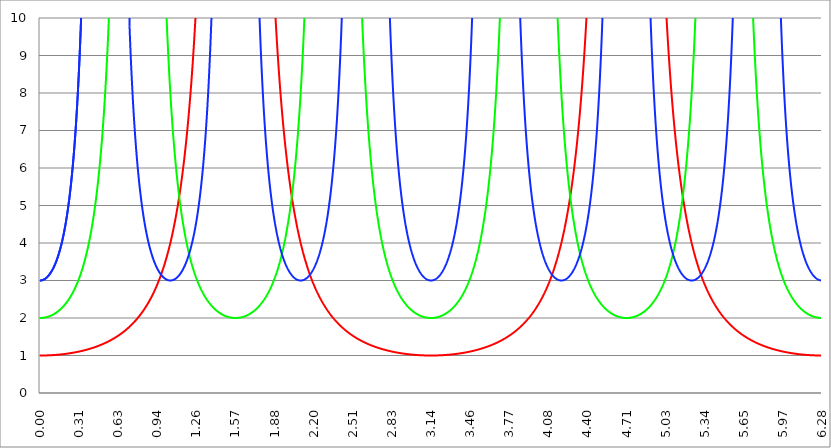
| Category | Series 1 | Series 0 | Series 2 |
|---|---|---|---|
| 0.0 | 1 | 2 | 3 |
| 0.00314159265358979 | 1 | 2 | 3 |
| 0.00628318530717958 | 1 | 2 | 3.001 |
| 0.00942477796076938 | 1 | 2.001 | 3.002 |
| 0.0125663706143592 | 1 | 2.001 | 3.004 |
| 0.015707963267949 | 1 | 2.002 | 3.007 |
| 0.0188495559215388 | 1 | 2.003 | 3.01 |
| 0.0219911485751285 | 1 | 2.004 | 3.013 |
| 0.0251327412287183 | 1.001 | 2.005 | 3.017 |
| 0.0282743338823081 | 1.001 | 2.006 | 3.022 |
| 0.0314159265358979 | 1.001 | 2.008 | 3.027 |
| 0.0345575191894877 | 1.001 | 2.01 | 3.032 |
| 0.0376991118430775 | 1.001 | 2.011 | 3.039 |
| 0.0408407044966673 | 1.002 | 2.013 | 3.045 |
| 0.0439822971502571 | 1.002 | 2.016 | 3.053 |
| 0.0471238898038469 | 1.002 | 2.018 | 3.061 |
| 0.0502654824574367 | 1.003 | 2.02 | 3.069 |
| 0.0534070751110265 | 1.003 | 2.023 | 3.078 |
| 0.0565486677646163 | 1.003 | 2.026 | 3.088 |
| 0.059690260418206 | 1.004 | 2.029 | 3.098 |
| 0.0628318530717958 | 1.004 | 2.032 | 3.109 |
| 0.0659734457253856 | 1.004 | 2.035 | 3.121 |
| 0.0691150383789754 | 1.005 | 2.039 | 3.133 |
| 0.0722566310325652 | 1.005 | 2.042 | 3.146 |
| 0.075398223686155 | 1.006 | 2.046 | 3.159 |
| 0.0785398163397448 | 1.006 | 2.05 | 3.173 |
| 0.0816814089933346 | 1.007 | 2.054 | 3.188 |
| 0.0848230016469244 | 1.007 | 2.059 | 3.203 |
| 0.0879645943005142 | 1.008 | 2.063 | 3.219 |
| 0.091106186954104 | 1.008 | 2.068 | 3.236 |
| 0.0942477796076937 | 1.009 | 2.073 | 3.253 |
| 0.0973893722612835 | 1.01 | 2.078 | 3.271 |
| 0.100530964914873 | 1.01 | 2.083 | 3.29 |
| 0.103672557568463 | 1.011 | 2.089 | 3.31 |
| 0.106814150222053 | 1.011 | 2.094 | 3.33 |
| 0.109955742875643 | 1.012 | 2.1 | 3.352 |
| 0.113097335529233 | 1.013 | 2.106 | 3.374 |
| 0.116238928182822 | 1.014 | 2.112 | 3.397 |
| 0.119380520836412 | 1.014 | 2.118 | 3.42 |
| 0.122522113490002 | 1.015 | 2.125 | 3.445 |
| 0.125663706143592 | 1.016 | 2.132 | 3.47 |
| 0.128805298797181 | 1.017 | 2.139 | 3.497 |
| 0.131946891450771 | 1.018 | 2.146 | 3.524 |
| 0.135088484104361 | 1.018 | 2.153 | 3.552 |
| 0.138230076757951 | 1.019 | 2.161 | 3.581 |
| 0.141371669411541 | 1.02 | 2.169 | 3.612 |
| 0.14451326206513 | 1.021 | 2.177 | 3.643 |
| 0.14765485471872 | 1.022 | 2.185 | 3.675 |
| 0.15079644737231 | 1.023 | 2.194 | 3.709 |
| 0.1539380400259 | 1.024 | 2.202 | 3.743 |
| 0.15707963267949 | 1.025 | 2.211 | 3.779 |
| 0.160221225333079 | 1.026 | 2.22 | 3.816 |
| 0.163362817986669 | 1.027 | 2.23 | 3.854 |
| 0.166504410640259 | 1.028 | 2.239 | 3.893 |
| 0.169646003293849 | 1.029 | 2.249 | 3.934 |
| 0.172787595947439 | 1.03 | 2.259 | 3.976 |
| 0.175929188601028 | 1.032 | 2.27 | 4.019 |
| 0.179070781254618 | 1.033 | 2.28 | 4.064 |
| 0.182212373908208 | 1.034 | 2.291 | 4.111 |
| 0.185353966561798 | 1.035 | 2.302 | 4.159 |
| 0.188495559215388 | 1.036 | 2.314 | 4.208 |
| 0.191637151868977 | 1.038 | 2.325 | 4.259 |
| 0.194778744522567 | 1.039 | 2.337 | 4.312 |
| 0.197920337176157 | 1.04 | 2.349 | 4.367 |
| 0.201061929829747 | 1.042 | 2.362 | 4.423 |
| 0.204203522483336 | 1.043 | 2.375 | 4.482 |
| 0.207345115136926 | 1.044 | 2.388 | 4.542 |
| 0.210486707790516 | 1.046 | 2.401 | 4.605 |
| 0.213628300444106 | 1.047 | 2.415 | 4.669 |
| 0.216769893097696 | 1.049 | 2.429 | 4.736 |
| 0.219911485751285 | 1.05 | 2.443 | 4.805 |
| 0.223053078404875 | 1.051 | 2.457 | 4.877 |
| 0.226194671058465 | 1.053 | 2.472 | 4.95 |
| 0.229336263712055 | 1.054 | 2.488 | 5.027 |
| 0.232477856365645 | 1.056 | 2.503 | 5.106 |
| 0.235619449019234 | 1.058 | 2.519 | 5.188 |
| 0.238761041672824 | 1.059 | 2.536 | 5.273 |
| 0.241902634326414 | 1.061 | 2.552 | 5.361 |
| 0.245044226980004 | 1.063 | 2.569 | 5.453 |
| 0.248185819633594 | 1.064 | 2.587 | 5.547 |
| 0.251327412287183 | 1.066 | 2.604 | 5.646 |
| 0.254469004940773 | 1.068 | 2.623 | 5.747 |
| 0.257610597594363 | 1.069 | 2.641 | 5.853 |
| 0.260752190247953 | 1.071 | 2.66 | 5.963 |
| 0.263893782901543 | 1.073 | 2.68 | 6.076 |
| 0.267035375555132 | 1.075 | 2.7 | 6.195 |
| 0.270176968208722 | 1.077 | 2.72 | 6.317 |
| 0.273318560862312 | 1.079 | 2.741 | 6.445 |
| 0.276460153515902 | 1.081 | 2.762 | 6.578 |
| 0.279601746169492 | 1.082 | 2.783 | 6.716 |
| 0.282743338823082 | 1.084 | 2.805 | 6.86 |
| 0.285884931476671 | 1.086 | 2.828 | 7.009 |
| 0.289026524130261 | 1.088 | 2.851 | 7.165 |
| 0.292168116783851 | 1.09 | 2.875 | 7.328 |
| 0.295309709437441 | 1.093 | 2.899 | 7.497 |
| 0.298451302091031 | 1.095 | 2.924 | 7.674 |
| 0.30159289474462 | 1.097 | 2.949 | 7.859 |
| 0.30473448739821 | 1.099 | 2.975 | 8.051 |
| 0.3078760800518 | 1.101 | 3.001 | 8.253 |
| 0.31101767270539 | 1.103 | 3.028 | 8.463 |
| 0.31415926535898 | 1.106 | 3.056 | 8.683 |
| 0.31730085801257 | 1.108 | 3.084 | 8.914 |
| 0.320442450666159 | 1.11 | 3.113 | 9.155 |
| 0.323584043319749 | 1.112 | 3.142 | 9.408 |
| 0.326725635973339 | 1.115 | 3.172 | 9.674 |
| 0.329867228626929 | 1.117 | 3.203 | 9.953 |
| 0.333008821280519 | 1.12 | 3.235 | 10.245 |
| 0.336150413934108 | 1.122 | 3.267 | 10.553 |
| 0.339292006587698 | 1.125 | 3.3 | 10.877 |
| 0.342433599241288 | 1.127 | 3.334 | 11.218 |
| 0.345575191894878 | 1.13 | 3.369 | 11.578 |
| 0.348716784548468 | 1.132 | 3.404 | 11.957 |
| 0.351858377202058 | 1.135 | 3.44 | 12.357 |
| 0.354999969855647 | 1.137 | 3.478 | 12.78 |
| 0.358141562509237 | 1.14 | 3.516 | 13.227 |
| 0.361283155162827 | 1.143 | 3.555 | 13.701 |
| 0.364424747816417 | 1.146 | 3.594 | 14.204 |
| 0.367566340470007 | 1.148 | 3.635 | 14.737 |
| 0.370707933123597 | 1.151 | 3.677 | 15.303 |
| 0.373849525777186 | 1.154 | 3.72 | 15.906 |
| 0.376991118430776 | 1.157 | 3.764 | 16.548 |
| 0.380132711084366 | 1.16 | 3.809 | 17.233 |
| 0.383274303737956 | 1.163 | 3.855 | 17.965 |
| 0.386415896391546 | 1.166 | 3.902 | 18.747 |
| 0.389557489045135 | 1.169 | 3.95 | 19.586 |
| 0.392699081698725 | 1.172 | 4 | 20.485 |
| 0.395840674352315 | 1.175 | 4.051 | 21.452 |
| 0.398982267005905 | 1.178 | 4.103 | 22.493 |
| 0.402123859659495 | 1.181 | 4.157 | 23.617 |
| 0.405265452313085 | 1.184 | 4.212 | 24.831 |
| 0.408407044966674 | 1.187 | 4.268 | 26.145 |
| 0.411548637620264 | 1.191 | 4.326 | 27.572 |
| 0.414690230273854 | 1.194 | 4.385 | 29.125 |
| 0.417831822927444 | 1.197 | 4.446 | 30.818 |
| 0.420973415581034 | 1.2 | 4.509 | 32.669 |
| 0.424115008234623 | 1.204 | 4.573 | 34.698 |
| 0.427256600888213 | 1.207 | 4.639 | 36.929 |
| 0.430398193541803 | 1.211 | 4.707 | 39.39 |
| 0.433539786195393 | 1.214 | 4.777 | 42.113 |
| 0.436681378848983 | 1.218 | 4.849 | 45.137 |
| 0.439822971502573 | 1.221 | 4.922 | 48.507 |
| 0.442964564156162 | 1.225 | 4.998 | 52.279 |
| 0.446106156809752 | 1.229 | 5.076 | 56.519 |
| 0.449247749463342 | 1.232 | 5.156 | 61.308 |
| 0.452389342116932 | 1.236 | 5.239 | 66.745 |
| 0.455530934770522 | 1.24 | 5.324 | 72.952 |
| 0.458672527424111 | 1.244 | 5.412 | 80.082 |
| 0.461814120077701 | 1.248 | 5.502 | 88.328 |
| 0.464955712731291 | 1.252 | 5.595 | 97.933 |
| 0.468097305384881 | 1.256 | 5.69 | 109.216 |
| 0.471238898038471 | 1.26 | 5.789 | 122.59 |
| 0.474380490692061 | 1.264 | 5.891 | 138.607 |
| 0.47752208334565 | 1.268 | 5.995 | 158.01 |
| 0.48066367599924 | 1.272 | 6.104 | 181.826 |
| 0.48380526865283 | 1.276 | 6.215 | 211.504 |
| 0.48694686130642 | 1.28 | 6.33 | 249.136 |
| 0.49008845396001 | 1.285 | 6.449 | 297.841 |
| 0.493230046613599 | 1.289 | 6.572 | 362.433 |
| 0.496371639267189 | 1.293 | 6.699 | 450.652 |
| 0.499513231920779 | 1.298 | 6.83 | 575.601 |
| 0.502654824574369 | 1.302 | 6.966 | 760.91 |
| 0.505796417227959 | 1.307 | 7.106 | 1052.778 |
| 0.508938009881549 | 1.311 | 7.251 | 1551.835 |
| 0.512079602535138 | 1.316 | 7.402 | 2513.096 |
| 0.515221195188728 | 1.321 | 7.557 | 4750.431 |
| 0.518362787842318 | 1.325 | 7.718 | 12159.542 |
| 0.521504380495908 | 1.33 | 7.885 | 75991.888 |
| 0.524645973149498 | 1.335 | 8.058 | 303964.551 |
| 0.527787565803087 | 1.34 | 8.238 | 18998.722 |
| 0.530929158456677 | 1.345 | 8.424 | 6204.338 |
| 0.534070751110267 | 1.35 | 8.617 | 3040.636 |
| 0.537212343763857 | 1.355 | 8.818 | 1799.601 |
| 0.540353936417447 | 1.36 | 9.027 | 1188.358 |
| 0.543495529071037 | 1.365 | 9.244 | 843.005 |
| 0.546637121724626 | 1.37 | 9.469 | 629.025 |
| 0.549778714378216 | 1.376 | 9.704 | 487.343 |
| 0.552920307031806 | 1.381 | 9.948 | 388.71 |
| 0.556061899685396 | 1.386 | 10.202 | 317.301 |
| 0.559203492338986 | 1.392 | 10.467 | 263.947 |
| 0.562345084992576 | 1.397 | 10.744 | 223.036 |
| 0.565486677646165 | 1.403 | 11.032 | 190.98 |
| 0.568628270299755 | 1.408 | 11.333 | 165.397 |
| 0.571769862953345 | 1.414 | 11.648 | 144.654 |
| 0.574911455606935 | 1.42 | 11.976 | 127.603 |
| 0.578053048260525 | 1.426 | 12.32 | 113.418 |
| 0.581194640914114 | 1.431 | 12.68 | 101.49 |
| 0.584336233567704 | 1.437 | 13.057 | 91.364 |
| 0.587477826221294 | 1.443 | 13.452 | 82.696 |
| 0.590619418874884 | 1.45 | 13.867 | 75.218 |
| 0.593761011528474 | 1.456 | 14.301 | 68.722 |
| 0.596902604182064 | 1.462 | 14.758 | 63.043 |
| 0.600044196835653 | 1.468 | 15.239 | 58.05 |
| 0.603185789489243 | 1.474 | 15.744 | 53.637 |
| 0.606327382142833 | 1.481 | 16.277 | 49.717 |
| 0.609468974796423 | 1.487 | 16.838 | 46.219 |
| 0.612610567450013 | 1.494 | 17.43 | 43.086 |
| 0.615752160103602 | 1.501 | 18.056 | 40.267 |
| 0.618893752757192 | 1.507 | 18.717 | 37.723 |
| 0.622035345410782 | 1.514 | 19.417 | 35.418 |
| 0.625176938064372 | 1.521 | 20.158 | 33.324 |
| 0.628318530717962 | 1.528 | 20.944 | 31.416 |
| 0.631460123371551 | 1.535 | 21.779 | 29.673 |
| 0.634601716025141 | 1.542 | 22.667 | 28.075 |
| 0.637743308678731 | 1.549 | 23.612 | 26.608 |
| 0.640884901332321 | 1.556 | 24.62 | 25.257 |
| 0.644026493985911 | 1.564 | 25.695 | 24.011 |
| 0.647168086639501 | 1.571 | 26.845 | 22.858 |
| 0.65030967929309 | 1.579 | 28.075 | 21.791 |
| 0.65345127194668 | 1.586 | 29.395 | 20.8 |
| 0.65659286460027 | 1.594 | 30.813 | 19.878 |
| 0.65973445725386 | 1.602 | 32.338 | 19.02 |
| 0.66287604990745 | 1.61 | 33.982 | 18.22 |
| 0.666017642561039 | 1.617 | 35.758 | 17.472 |
| 0.669159235214629 | 1.626 | 37.679 | 16.772 |
| 0.672300827868219 | 1.634 | 39.764 | 16.116 |
| 0.675442420521809 | 1.642 | 42.029 | 15.5 |
| 0.678584013175399 | 1.65 | 44.497 | 14.922 |
| 0.681725605828989 | 1.659 | 47.193 | 14.378 |
| 0.684867198482578 | 1.667 | 50.145 | 13.865 |
| 0.688008791136168 | 1.676 | 53.388 | 13.382 |
| 0.691150383789758 | 1.684 | 56.961 | 12.926 |
| 0.694291976443348 | 1.693 | 60.91 | 12.495 |
| 0.697433569096938 | 1.702 | 65.289 | 12.088 |
| 0.700575161750528 | 1.711 | 70.164 | 11.702 |
| 0.703716754404117 | 1.72 | 75.612 | 11.336 |
| 0.706858347057707 | 1.729 | 81.727 | 10.989 |
| 0.709999939711297 | 1.739 | 88.622 | 10.659 |
| 0.713141532364887 | 1.748 | 96.436 | 10.346 |
| 0.716283125018477 | 1.758 | 105.34 | 10.049 |
| 0.719424717672066 | 1.767 | 115.546 | 9.765 |
| 0.722566310325656 | 1.777 | 127.32 | 9.496 |
| 0.725707902979246 | 1.787 | 141.003 | 9.238 |
| 0.728849495632836 | 1.797 | 157.028 | 8.993 |
| 0.731991088286426 | 1.807 | 175.964 | 8.759 |
| 0.735132680940016 | 1.818 | 198.561 | 8.535 |
| 0.738274273593605 | 1.828 | 225.826 | 8.322 |
| 0.741415866247195 | 1.838 | 259.14 | 8.117 |
| 0.744557458900785 | 1.849 | 300.434 | 7.922 |
| 0.747699051554375 | 1.86 | 352.477 | 7.735 |
| 0.750840644207965 | 1.871 | 419.35 | 7.555 |
| 0.753982236861554 | 1.882 | 507.273 | 7.384 |
| 0.757123829515144 | 1.893 | 626.106 | 7.219 |
| 0.760265422168734 | 1.904 | 792.239 | 7.061 |
| 0.763407014822324 | 1.916 | 1034.557 | 6.909 |
| 0.766548607475914 | 1.927 | 1407.906 | 6.763 |
| 0.769690200129504 | 1.939 | 2027.09 | 6.623 |
| 0.772831792783093 | 1.951 | 3166.954 | 6.489 |
| 0.775973385436683 | 1.963 | 5629.621 | 6.359 |
| 0.779114978090273 | 1.975 | 12665.815 | 6.235 |
| 0.782256570743863 | 1.988 | 50661.258 | 6.115 |
| 0.785398163397453 | 2 | 25706381619688702014243471360 | 6 |
| 0.788539756051042 | 2.013 | 50661.258 | 5.889 |
| 0.791681348704632 | 2.025 | 12665.815 | 5.782 |
| 0.794822941358222 | 2.038 | 5629.621 | 5.679 |
| 0.797964534011812 | 2.052 | 3166.954 | 5.58 |
| 0.801106126665402 | 2.065 | 2027.09 | 5.484 |
| 0.804247719318992 | 2.078 | 1407.906 | 5.392 |
| 0.807389311972581 | 2.092 | 1034.557 | 5.302 |
| 0.810530904626171 | 2.106 | 792.239 | 5.216 |
| 0.813672497279761 | 2.12 | 626.106 | 5.133 |
| 0.816814089933351 | 2.134 | 507.273 | 5.053 |
| 0.819955682586941 | 2.148 | 419.35 | 4.976 |
| 0.823097275240531 | 2.163 | 352.477 | 4.901 |
| 0.82623886789412 | 2.178 | 300.434 | 4.829 |
| 0.82938046054771 | 2.193 | 259.14 | 4.759 |
| 0.8325220532013 | 2.208 | 225.826 | 4.691 |
| 0.83566364585489 | 2.223 | 198.561 | 4.626 |
| 0.83880523850848 | 2.239 | 175.964 | 4.563 |
| 0.841946831162069 | 2.254 | 157.028 | 4.502 |
| 0.845088423815659 | 2.27 | 141.003 | 4.443 |
| 0.848230016469249 | 2.287 | 127.32 | 4.386 |
| 0.851371609122839 | 2.303 | 115.546 | 4.33 |
| 0.854513201776429 | 2.32 | 105.34 | 4.277 |
| 0.857654794430019 | 2.336 | 96.436 | 4.225 |
| 0.860796387083608 | 2.354 | 88.622 | 4.175 |
| 0.863937979737198 | 2.371 | 81.727 | 4.127 |
| 0.867079572390788 | 2.388 | 75.612 | 4.08 |
| 0.870221165044378 | 2.406 | 70.164 | 4.034 |
| 0.873362757697968 | 2.424 | 65.289 | 3.99 |
| 0.876504350351557 | 2.443 | 60.91 | 3.948 |
| 0.879645943005147 | 2.461 | 56.961 | 3.907 |
| 0.882787535658737 | 2.48 | 53.388 | 3.867 |
| 0.885929128312327 | 2.499 | 50.145 | 3.828 |
| 0.889070720965917 | 2.518 | 47.193 | 3.791 |
| 0.892212313619507 | 2.538 | 44.497 | 3.755 |
| 0.895353906273096 | 2.558 | 42.029 | 3.72 |
| 0.898495498926686 | 2.578 | 39.764 | 3.686 |
| 0.901637091580276 | 2.599 | 37.679 | 3.654 |
| 0.904778684233866 | 2.62 | 35.758 | 3.622 |
| 0.907920276887456 | 2.641 | 33.982 | 3.591 |
| 0.911061869541045 | 2.662 | 32.338 | 3.562 |
| 0.914203462194635 | 2.684 | 30.813 | 3.533 |
| 0.917345054848225 | 2.706 | 29.395 | 3.506 |
| 0.920486647501815 | 2.728 | 28.075 | 3.479 |
| 0.923628240155405 | 2.751 | 26.845 | 3.453 |
| 0.926769832808995 | 2.774 | 25.695 | 3.428 |
| 0.929911425462584 | 2.797 | 24.62 | 3.404 |
| 0.933053018116174 | 2.821 | 23.612 | 3.381 |
| 0.936194610769764 | 2.845 | 22.667 | 3.359 |
| 0.939336203423354 | 2.87 | 21.779 | 3.337 |
| 0.942477796076944 | 2.894 | 20.944 | 3.317 |
| 0.945619388730533 | 2.92 | 20.158 | 3.297 |
| 0.948760981384123 | 2.945 | 19.417 | 3.278 |
| 0.951902574037713 | 2.971 | 18.717 | 3.259 |
| 0.955044166691303 | 2.998 | 18.056 | 3.242 |
| 0.958185759344893 | 3.025 | 17.43 | 3.225 |
| 0.961327351998483 | 3.052 | 16.838 | 3.208 |
| 0.964468944652072 | 3.079 | 16.277 | 3.193 |
| 0.967610537305662 | 3.108 | 15.744 | 3.178 |
| 0.970752129959252 | 3.136 | 15.239 | 3.163 |
| 0.973893722612842 | 3.165 | 14.758 | 3.15 |
| 0.977035315266432 | 3.195 | 14.301 | 3.137 |
| 0.980176907920022 | 3.225 | 13.867 | 3.125 |
| 0.983318500573611 | 3.255 | 13.452 | 3.113 |
| 0.986460093227201 | 3.286 | 13.057 | 3.102 |
| 0.989601685880791 | 3.318 | 12.68 | 3.091 |
| 0.992743278534381 | 3.35 | 12.32 | 3.082 |
| 0.995884871187971 | 3.382 | 11.976 | 3.072 |
| 0.99902646384156 | 3.415 | 11.648 | 3.064 |
| 1.00216805649515 | 3.449 | 11.333 | 3.055 |
| 1.00530964914874 | 3.483 | 11.032 | 3.048 |
| 1.00845124180233 | 3.518 | 10.744 | 3.041 |
| 1.01159283445592 | 3.553 | 10.467 | 3.034 |
| 1.01473442710951 | 3.589 | 10.202 | 3.029 |
| 1.017876019763099 | 3.626 | 9.948 | 3.023 |
| 1.021017612416689 | 3.663 | 9.704 | 3.019 |
| 1.02415920507028 | 3.701 | 9.469 | 3.014 |
| 1.027300797723869 | 3.739 | 9.244 | 3.011 |
| 1.030442390377459 | 3.779 | 9.027 | 3.008 |
| 1.033583983031048 | 3.819 | 8.818 | 3.005 |
| 1.036725575684638 | 3.859 | 8.617 | 3.003 |
| 1.039867168338228 | 3.901 | 8.424 | 3.001 |
| 1.043008760991818 | 3.943 | 8.238 | 3 |
| 1.046150353645408 | 3.986 | 8.058 | 3 |
| 1.049291946298998 | 4.029 | 7.885 | 3 |
| 1.052433538952587 | 4.074 | 7.718 | 3.001 |
| 1.055575131606177 | 4.119 | 7.557 | 3.002 |
| 1.058716724259767 | 4.165 | 7.402 | 3.004 |
| 1.061858316913357 | 4.212 | 7.251 | 3.006 |
| 1.064999909566947 | 4.26 | 7.106 | 3.009 |
| 1.068141502220536 | 4.309 | 6.966 | 3.012 |
| 1.071283094874126 | 4.358 | 6.83 | 3.016 |
| 1.074424687527716 | 4.409 | 6.699 | 3.02 |
| 1.077566280181306 | 4.461 | 6.572 | 3.025 |
| 1.080707872834896 | 4.513 | 6.449 | 3.031 |
| 1.083849465488486 | 4.567 | 6.33 | 3.037 |
| 1.086991058142075 | 4.622 | 6.215 | 3.043 |
| 1.090132650795665 | 4.678 | 6.104 | 3.05 |
| 1.093274243449255 | 4.735 | 5.995 | 3.058 |
| 1.096415836102845 | 4.793 | 5.891 | 3.066 |
| 1.099557428756435 | 4.852 | 5.789 | 3.075 |
| 1.102699021410025 | 4.912 | 5.69 | 3.085 |
| 1.105840614063614 | 4.974 | 5.595 | 3.095 |
| 1.108982206717204 | 5.037 | 5.502 | 3.105 |
| 1.112123799370794 | 5.101 | 5.412 | 3.117 |
| 1.115265392024384 | 5.167 | 5.324 | 3.129 |
| 1.118406984677974 | 5.234 | 5.239 | 3.141 |
| 1.121548577331563 | 5.302 | 5.156 | 3.154 |
| 1.124690169985153 | 5.372 | 5.076 | 3.168 |
| 1.127831762638743 | 5.443 | 4.998 | 3.183 |
| 1.130973355292333 | 5.516 | 4.922 | 3.198 |
| 1.134114947945923 | 5.591 | 4.849 | 3.214 |
| 1.137256540599513 | 5.667 | 4.777 | 3.23 |
| 1.140398133253102 | 5.744 | 4.707 | 3.247 |
| 1.143539725906692 | 5.824 | 4.639 | 3.265 |
| 1.146681318560282 | 5.905 | 4.573 | 3.284 |
| 1.149822911213872 | 5.988 | 4.509 | 3.303 |
| 1.152964503867462 | 6.073 | 4.446 | 3.324 |
| 1.156106096521051 | 6.16 | 4.385 | 3.344 |
| 1.159247689174641 | 6.249 | 4.326 | 3.366 |
| 1.162389281828231 | 6.34 | 4.268 | 3.389 |
| 1.165530874481821 | 6.433 | 4.212 | 3.412 |
| 1.168672467135411 | 6.529 | 4.157 | 3.437 |
| 1.171814059789001 | 6.626 | 4.103 | 3.462 |
| 1.17495565244259 | 6.726 | 4.051 | 3.488 |
| 1.17809724509618 | 6.828 | 4 | 3.515 |
| 1.18123883774977 | 6.933 | 3.95 | 3.543 |
| 1.18438043040336 | 7.041 | 3.902 | 3.572 |
| 1.18752202305695 | 7.151 | 3.855 | 3.601 |
| 1.190663615710539 | 7.264 | 3.809 | 3.632 |
| 1.193805208364129 | 7.379 | 3.764 | 3.664 |
| 1.19694680101772 | 7.498 | 3.72 | 3.697 |
| 1.200088393671309 | 7.619 | 3.677 | 3.732 |
| 1.203229986324899 | 7.744 | 3.635 | 3.767 |
| 1.206371578978489 | 7.872 | 3.594 | 3.803 |
| 1.209513171632078 | 8.004 | 3.555 | 3.841 |
| 1.212654764285668 | 8.138 | 3.516 | 3.88 |
| 1.215796356939258 | 8.277 | 3.478 | 3.92 |
| 1.218937949592848 | 8.419 | 3.44 | 3.962 |
| 1.222079542246438 | 8.565 | 3.404 | 4.005 |
| 1.225221134900027 | 8.715 | 3.369 | 4.049 |
| 1.228362727553617 | 8.869 | 3.334 | 4.095 |
| 1.231504320207207 | 9.028 | 3.3 | 4.143 |
| 1.234645912860797 | 9.191 | 3.267 | 4.192 |
| 1.237787505514387 | 9.358 | 3.235 | 4.242 |
| 1.240929098167977 | 9.531 | 3.203 | 4.294 |
| 1.244070690821566 | 9.708 | 3.172 | 4.349 |
| 1.247212283475156 | 9.891 | 3.142 | 4.404 |
| 1.250353876128746 | 10.079 | 3.113 | 4.462 |
| 1.253495468782336 | 10.273 | 3.084 | 4.522 |
| 1.256637061435926 | 10.472 | 3.056 | 4.584 |
| 1.259778654089515 | 10.678 | 3.028 | 4.647 |
| 1.262920246743105 | 10.89 | 3.001 | 4.713 |
| 1.266061839396695 | 11.108 | 2.975 | 4.782 |
| 1.269203432050285 | 11.334 | 2.949 | 4.852 |
| 1.272345024703875 | 11.566 | 2.924 | 4.926 |
| 1.275486617357465 | 11.806 | 2.899 | 5.001 |
| 1.278628210011054 | 12.054 | 2.875 | 5.08 |
| 1.281769802664644 | 12.31 | 2.851 | 5.161 |
| 1.284911395318234 | 12.574 | 2.828 | 5.245 |
| 1.288052987971824 | 12.848 | 2.805 | 5.332 |
| 1.291194580625414 | 13.13 | 2.783 | 5.422 |
| 1.294336173279003 | 13.422 | 2.762 | 5.515 |
| 1.297477765932593 | 13.725 | 2.741 | 5.612 |
| 1.300619358586183 | 14.038 | 2.72 | 5.713 |
| 1.303760951239773 | 14.362 | 2.7 | 5.817 |
| 1.306902543893363 | 14.698 | 2.68 | 5.926 |
| 1.310044136546953 | 15.046 | 2.66 | 6.038 |
| 1.313185729200542 | 15.406 | 2.641 | 6.155 |
| 1.316327321854132 | 15.781 | 2.623 | 6.276 |
| 1.319468914507722 | 16.169 | 2.604 | 6.402 |
| 1.322610507161312 | 16.572 | 2.587 | 6.533 |
| 1.325752099814902 | 16.991 | 2.569 | 6.669 |
| 1.328893692468491 | 17.426 | 2.552 | 6.811 |
| 1.332035285122081 | 17.879 | 2.536 | 6.959 |
| 1.335176877775671 | 18.35 | 2.519 | 7.113 |
| 1.338318470429261 | 18.84 | 2.503 | 7.273 |
| 1.341460063082851 | 19.35 | 2.488 | 7.44 |
| 1.344601655736441 | 19.882 | 2.472 | 7.614 |
| 1.34774324839003 | 20.436 | 2.457 | 7.796 |
| 1.35088484104362 | 21.014 | 2.443 | 7.986 |
| 1.35402643369721 | 21.618 | 2.429 | 8.184 |
| 1.3571680263508 | 22.248 | 2.415 | 8.392 |
| 1.36030961900439 | 22.907 | 2.401 | 8.609 |
| 1.363451211657979 | 23.596 | 2.388 | 8.836 |
| 1.36659280431157 | 24.317 | 2.375 | 9.074 |
| 1.369734396965159 | 25.073 | 2.362 | 9.323 |
| 1.372875989618749 | 25.864 | 2.349 | 9.584 |
| 1.376017582272339 | 26.694 | 2.337 | 9.858 |
| 1.379159174925929 | 27.565 | 2.325 | 10.146 |
| 1.382300767579518 | 28.48 | 2.314 | 10.449 |
| 1.385442360233108 | 29.443 | 2.302 | 10.767 |
| 1.388583952886698 | 30.455 | 2.291 | 11.102 |
| 1.391725545540288 | 31.521 | 2.28 | 11.456 |
| 1.394867138193878 | 32.644 | 2.27 | 11.828 |
| 1.398008730847468 | 33.83 | 2.259 | 12.221 |
| 1.401150323501057 | 35.082 | 2.249 | 12.636 |
| 1.404291916154647 | 36.405 | 2.239 | 13.075 |
| 1.407433508808237 | 37.806 | 2.23 | 13.54 |
| 1.410575101461827 | 39.29 | 2.22 | 14.033 |
| 1.413716694115417 | 40.863 | 2.211 | 14.556 |
| 1.416858286769006 | 42.534 | 2.202 | 15.111 |
| 1.419999879422596 | 44.311 | 2.194 | 15.701 |
| 1.423141472076186 | 46.202 | 2.185 | 16.33 |
| 1.426283064729776 | 48.218 | 2.177 | 17 |
| 1.429424657383366 | 50.37 | 2.169 | 17.715 |
| 1.432566250036956 | 52.67 | 2.161 | 18.48 |
| 1.435707842690545 | 55.132 | 2.153 | 19.3 |
| 1.438849435344135 | 57.773 | 2.146 | 20.178 |
| 1.441991027997725 | 60.609 | 2.139 | 21.122 |
| 1.445132620651315 | 63.66 | 2.132 | 22.138 |
| 1.448274213304905 | 66.949 | 2.125 | 23.233 |
| 1.451415805958494 | 70.501 | 2.118 | 24.415 |
| 1.454557398612084 | 74.345 | 2.112 | 25.695 |
| 1.457698991265674 | 78.514 | 2.106 | 27.083 |
| 1.460840583919264 | 83.045 | 2.1 | 28.593 |
| 1.463982176572854 | 87.982 | 2.094 | 30.237 |
| 1.467123769226444 | 93.375 | 2.089 | 32.033 |
| 1.470265361880033 | 99.28 | 2.083 | 34.001 |
| 1.473406954533623 | 105.767 | 2.078 | 36.162 |
| 1.476548547187213 | 112.913 | 2.073 | 38.543 |
| 1.479690139840803 | 120.811 | 2.068 | 41.174 |
| 1.482831732494393 | 129.57 | 2.063 | 44.093 |
| 1.485973325147982 | 139.32 | 2.059 | 47.342 |
| 1.489114917801572 | 150.217 | 2.054 | 50.973 |
| 1.492256510455162 | 162.448 | 2.05 | 55.049 |
| 1.495398103108752 | 176.239 | 2.046 | 59.645 |
| 1.498539695762342 | 191.867 | 2.042 | 64.854 |
| 1.501681288415932 | 209.675 | 2.039 | 70.789 |
| 1.504822881069521 | 230.087 | 2.035 | 77.592 |
| 1.507964473723111 | 253.637 | 2.032 | 85.441 |
| 1.511106066376701 | 281.002 | 2.029 | 94.562 |
| 1.514247659030291 | 313.053 | 2.026 | 105.246 |
| 1.517389251683881 | 350.926 | 2.023 | 117.869 |
| 1.520530844337471 | 396.119 | 2.02 | 132.933 |
| 1.52367243699106 | 450.65 | 2.018 | 151.109 |
| 1.52681402964465 | 517.278 | 2.016 | 173.318 |
| 1.52995562229824 | 599.867 | 2.013 | 200.848 |
| 1.53309721495183 | 703.953 | 2.011 | 235.542 |
| 1.53623880760542 | 837.699 | 2.01 | 280.124 |
| 1.539380400259009 | 1013.545 | 2.008 | 338.739 |
| 1.542521992912599 | 1251.212 | 2.006 | 417.961 |
| 1.545663585566189 | 1583.477 | 2.005 | 528.716 |
| 1.548805178219779 | 2068.113 | 2.004 | 690.261 |
| 1.551946770873369 | 2814.811 | 2.003 | 939.16 |
| 1.555088363526959 | 4053.181 | 2.002 | 1351.95 |
| 1.558229956180548 | 6332.907 | 2.001 | 2111.858 |
| 1.561371548834138 | 11258.243 | 2.001 | 3753.637 |
| 1.564513141487728 | 25330.629 | 2 | 8444.432 |
| 1.567654734141318 | 101321.517 | 2 | 33774.728 |
| 1.570796326794908 | 8203238119201189953198358528 | 2 | 2662539128422490196662026240 |
| 1.573937919448497 | 101321.517 | 2 | 33774.728 |
| 1.577079512102087 | 25330.629 | 2 | 8444.432 |
| 1.580221104755677 | 11258.243 | 2.001 | 3753.637 |
| 1.583362697409267 | 6332.907 | 2.001 | 2111.858 |
| 1.586504290062857 | 4053.181 | 2.002 | 1351.95 |
| 1.589645882716447 | 2814.811 | 2.003 | 939.16 |
| 1.592787475370036 | 2068.113 | 2.004 | 690.261 |
| 1.595929068023626 | 1583.477 | 2.005 | 528.716 |
| 1.599070660677216 | 1251.212 | 2.006 | 417.961 |
| 1.602212253330806 | 1013.545 | 2.008 | 338.739 |
| 1.605353845984396 | 837.699 | 2.01 | 280.124 |
| 1.608495438637985 | 703.953 | 2.011 | 235.542 |
| 1.611637031291575 | 599.867 | 2.013 | 200.848 |
| 1.614778623945165 | 517.278 | 2.016 | 173.318 |
| 1.617920216598755 | 450.65 | 2.018 | 151.109 |
| 1.621061809252345 | 396.119 | 2.02 | 132.933 |
| 1.624203401905935 | 350.926 | 2.023 | 117.869 |
| 1.627344994559524 | 313.053 | 2.026 | 105.246 |
| 1.630486587213114 | 281.002 | 2.029 | 94.562 |
| 1.633628179866704 | 253.637 | 2.032 | 85.441 |
| 1.636769772520294 | 230.087 | 2.035 | 77.592 |
| 1.639911365173884 | 209.675 | 2.039 | 70.789 |
| 1.643052957827473 | 191.867 | 2.042 | 64.854 |
| 1.646194550481063 | 176.239 | 2.046 | 59.645 |
| 1.649336143134653 | 162.448 | 2.05 | 55.049 |
| 1.652477735788243 | 150.217 | 2.054 | 50.973 |
| 1.655619328441833 | 139.32 | 2.059 | 47.342 |
| 1.658760921095423 | 129.57 | 2.063 | 44.093 |
| 1.661902513749012 | 120.811 | 2.068 | 41.174 |
| 1.665044106402602 | 112.913 | 2.073 | 38.543 |
| 1.668185699056192 | 105.767 | 2.078 | 36.162 |
| 1.671327291709782 | 99.28 | 2.083 | 34.001 |
| 1.674468884363372 | 93.375 | 2.089 | 32.033 |
| 1.677610477016961 | 87.982 | 2.094 | 30.237 |
| 1.680752069670551 | 83.045 | 2.1 | 28.593 |
| 1.683893662324141 | 78.514 | 2.106 | 27.083 |
| 1.687035254977731 | 74.345 | 2.112 | 25.695 |
| 1.690176847631321 | 70.501 | 2.118 | 24.415 |
| 1.693318440284911 | 66.949 | 2.125 | 23.233 |
| 1.6964600329385 | 63.66 | 2.132 | 22.138 |
| 1.69960162559209 | 60.609 | 2.139 | 21.122 |
| 1.70274321824568 | 57.773 | 2.146 | 20.178 |
| 1.70588481089927 | 55.132 | 2.153 | 19.3 |
| 1.70902640355286 | 52.67 | 2.161 | 18.48 |
| 1.712167996206449 | 50.37 | 2.169 | 17.715 |
| 1.715309588860039 | 48.218 | 2.177 | 17 |
| 1.71845118151363 | 46.202 | 2.185 | 16.33 |
| 1.721592774167219 | 44.311 | 2.194 | 15.701 |
| 1.724734366820809 | 42.534 | 2.202 | 15.111 |
| 1.727875959474399 | 40.863 | 2.211 | 14.556 |
| 1.731017552127988 | 39.29 | 2.22 | 14.033 |
| 1.734159144781578 | 37.806 | 2.23 | 13.54 |
| 1.737300737435168 | 36.405 | 2.239 | 13.075 |
| 1.740442330088758 | 35.082 | 2.249 | 12.636 |
| 1.743583922742348 | 33.83 | 2.259 | 12.221 |
| 1.746725515395937 | 32.644 | 2.27 | 11.828 |
| 1.749867108049527 | 31.521 | 2.28 | 11.456 |
| 1.753008700703117 | 30.455 | 2.291 | 11.102 |
| 1.756150293356707 | 29.443 | 2.302 | 10.767 |
| 1.759291886010297 | 28.48 | 2.314 | 10.449 |
| 1.762433478663887 | 27.565 | 2.325 | 10.146 |
| 1.765575071317476 | 26.694 | 2.337 | 9.858 |
| 1.768716663971066 | 25.864 | 2.349 | 9.584 |
| 1.771858256624656 | 25.073 | 2.362 | 9.323 |
| 1.774999849278246 | 24.317 | 2.375 | 9.074 |
| 1.778141441931836 | 23.596 | 2.388 | 8.836 |
| 1.781283034585426 | 22.907 | 2.401 | 8.609 |
| 1.784424627239015 | 22.248 | 2.415 | 8.392 |
| 1.787566219892605 | 21.618 | 2.429 | 8.184 |
| 1.790707812546195 | 21.014 | 2.443 | 7.986 |
| 1.793849405199785 | 20.436 | 2.457 | 7.796 |
| 1.796990997853375 | 19.882 | 2.472 | 7.614 |
| 1.800132590506964 | 19.35 | 2.488 | 7.44 |
| 1.803274183160554 | 18.84 | 2.503 | 7.273 |
| 1.806415775814144 | 18.35 | 2.519 | 7.113 |
| 1.809557368467734 | 17.879 | 2.536 | 6.959 |
| 1.812698961121324 | 17.426 | 2.552 | 6.811 |
| 1.815840553774914 | 16.991 | 2.569 | 6.669 |
| 1.818982146428503 | 16.572 | 2.587 | 6.533 |
| 1.822123739082093 | 16.169 | 2.604 | 6.402 |
| 1.825265331735683 | 15.781 | 2.623 | 6.276 |
| 1.828406924389273 | 15.406 | 2.641 | 6.155 |
| 1.831548517042863 | 15.046 | 2.66 | 6.038 |
| 1.834690109696452 | 14.698 | 2.68 | 5.926 |
| 1.837831702350042 | 14.362 | 2.7 | 5.817 |
| 1.840973295003632 | 14.038 | 2.72 | 5.713 |
| 1.844114887657222 | 13.725 | 2.741 | 5.612 |
| 1.847256480310812 | 13.422 | 2.762 | 5.515 |
| 1.850398072964402 | 13.13 | 2.783 | 5.422 |
| 1.853539665617991 | 12.848 | 2.805 | 5.332 |
| 1.856681258271581 | 12.574 | 2.828 | 5.245 |
| 1.859822850925171 | 12.31 | 2.851 | 5.161 |
| 1.862964443578761 | 12.054 | 2.875 | 5.08 |
| 1.866106036232351 | 11.806 | 2.899 | 5.001 |
| 1.86924762888594 | 11.566 | 2.924 | 4.926 |
| 1.87238922153953 | 11.334 | 2.949 | 4.852 |
| 1.87553081419312 | 11.108 | 2.975 | 4.782 |
| 1.87867240684671 | 10.89 | 3.001 | 4.713 |
| 1.8818139995003 | 10.678 | 3.028 | 4.647 |
| 1.88495559215389 | 10.472 | 3.056 | 4.584 |
| 1.888097184807479 | 10.273 | 3.084 | 4.522 |
| 1.891238777461069 | 10.079 | 3.113 | 4.462 |
| 1.89438037011466 | 9.891 | 3.142 | 4.404 |
| 1.897521962768249 | 9.708 | 3.172 | 4.349 |
| 1.900663555421839 | 9.531 | 3.203 | 4.294 |
| 1.903805148075429 | 9.358 | 3.235 | 4.242 |
| 1.906946740729018 | 9.191 | 3.267 | 4.192 |
| 1.910088333382608 | 9.028 | 3.3 | 4.143 |
| 1.913229926036198 | 8.869 | 3.334 | 4.095 |
| 1.916371518689788 | 8.715 | 3.369 | 4.049 |
| 1.919513111343378 | 8.565 | 3.404 | 4.005 |
| 1.922654703996967 | 8.419 | 3.44 | 3.962 |
| 1.925796296650557 | 8.277 | 3.478 | 3.92 |
| 1.928937889304147 | 8.138 | 3.516 | 3.88 |
| 1.932079481957737 | 8.004 | 3.555 | 3.841 |
| 1.935221074611327 | 7.872 | 3.594 | 3.803 |
| 1.938362667264917 | 7.744 | 3.635 | 3.767 |
| 1.941504259918506 | 7.619 | 3.677 | 3.732 |
| 1.944645852572096 | 7.498 | 3.72 | 3.697 |
| 1.947787445225686 | 7.379 | 3.764 | 3.664 |
| 1.950929037879276 | 7.264 | 3.809 | 3.632 |
| 1.954070630532866 | 7.151 | 3.855 | 3.601 |
| 1.957212223186455 | 7.041 | 3.902 | 3.572 |
| 1.960353815840045 | 6.933 | 3.95 | 3.543 |
| 1.963495408493635 | 6.828 | 4 | 3.515 |
| 1.966637001147225 | 6.726 | 4.051 | 3.488 |
| 1.969778593800815 | 6.626 | 4.103 | 3.462 |
| 1.972920186454405 | 6.529 | 4.157 | 3.437 |
| 1.976061779107994 | 6.433 | 4.212 | 3.412 |
| 1.979203371761584 | 6.34 | 4.268 | 3.389 |
| 1.982344964415174 | 6.249 | 4.326 | 3.366 |
| 1.985486557068764 | 6.16 | 4.385 | 3.344 |
| 1.988628149722354 | 6.073 | 4.446 | 3.324 |
| 1.991769742375943 | 5.988 | 4.509 | 3.303 |
| 1.994911335029533 | 5.905 | 4.573 | 3.284 |
| 1.998052927683123 | 5.824 | 4.639 | 3.265 |
| 2.001194520336712 | 5.744 | 4.707 | 3.247 |
| 2.004336112990302 | 5.667 | 4.777 | 3.23 |
| 2.007477705643892 | 5.591 | 4.849 | 3.214 |
| 2.010619298297482 | 5.516 | 4.922 | 3.198 |
| 2.013760890951071 | 5.443 | 4.998 | 3.183 |
| 2.016902483604661 | 5.372 | 5.076 | 3.168 |
| 2.02004407625825 | 5.302 | 5.156 | 3.154 |
| 2.02318566891184 | 5.234 | 5.239 | 3.141 |
| 2.02632726156543 | 5.167 | 5.324 | 3.129 |
| 2.029468854219019 | 5.101 | 5.412 | 3.117 |
| 2.032610446872609 | 5.037 | 5.502 | 3.105 |
| 2.035752039526198 | 4.974 | 5.595 | 3.095 |
| 2.038893632179788 | 4.912 | 5.69 | 3.085 |
| 2.042035224833378 | 4.852 | 5.789 | 3.075 |
| 2.045176817486967 | 4.793 | 5.891 | 3.066 |
| 2.048318410140557 | 4.735 | 5.995 | 3.058 |
| 2.051460002794146 | 4.678 | 6.104 | 3.05 |
| 2.054601595447736 | 4.622 | 6.215 | 3.043 |
| 2.057743188101325 | 4.567 | 6.33 | 3.037 |
| 2.060884780754915 | 4.513 | 6.449 | 3.031 |
| 2.064026373408505 | 4.461 | 6.572 | 3.025 |
| 2.067167966062094 | 4.409 | 6.699 | 3.02 |
| 2.070309558715684 | 4.358 | 6.83 | 3.016 |
| 2.073451151369273 | 4.309 | 6.966 | 3.012 |
| 2.076592744022863 | 4.26 | 7.106 | 3.009 |
| 2.079734336676452 | 4.212 | 7.251 | 3.006 |
| 2.082875929330042 | 4.165 | 7.402 | 3.004 |
| 2.086017521983632 | 4.119 | 7.557 | 3.002 |
| 2.089159114637221 | 4.074 | 7.718 | 3.001 |
| 2.092300707290811 | 4.029 | 7.885 | 3 |
| 2.095442299944401 | 3.986 | 8.058 | 3 |
| 2.09858389259799 | 3.943 | 8.238 | 3 |
| 2.10172548525158 | 3.901 | 8.424 | 3.001 |
| 2.104867077905169 | 3.859 | 8.617 | 3.003 |
| 2.108008670558759 | 3.819 | 8.818 | 3.005 |
| 2.111150263212349 | 3.779 | 9.027 | 3.008 |
| 2.114291855865938 | 3.739 | 9.244 | 3.011 |
| 2.117433448519528 | 3.701 | 9.469 | 3.014 |
| 2.120575041173117 | 3.663 | 9.704 | 3.019 |
| 2.123716633826707 | 3.626 | 9.948 | 3.023 |
| 2.126858226480297 | 3.589 | 10.202 | 3.029 |
| 2.129999819133886 | 3.553 | 10.467 | 3.034 |
| 2.133141411787476 | 3.518 | 10.744 | 3.041 |
| 2.136283004441065 | 3.483 | 11.032 | 3.048 |
| 2.139424597094655 | 3.449 | 11.333 | 3.055 |
| 2.142566189748245 | 3.415 | 11.648 | 3.064 |
| 2.145707782401834 | 3.382 | 11.976 | 3.072 |
| 2.148849375055424 | 3.35 | 12.32 | 3.082 |
| 2.151990967709013 | 3.318 | 12.68 | 3.091 |
| 2.155132560362603 | 3.286 | 13.057 | 3.102 |
| 2.158274153016193 | 3.255 | 13.452 | 3.113 |
| 2.161415745669782 | 3.225 | 13.867 | 3.125 |
| 2.164557338323372 | 3.195 | 14.301 | 3.137 |
| 2.167698930976961 | 3.165 | 14.758 | 3.15 |
| 2.170840523630551 | 3.136 | 15.239 | 3.163 |
| 2.173982116284141 | 3.108 | 15.744 | 3.178 |
| 2.17712370893773 | 3.079 | 16.277 | 3.193 |
| 2.18026530159132 | 3.052 | 16.838 | 3.208 |
| 2.183406894244909 | 3.025 | 17.43 | 3.225 |
| 2.186548486898499 | 2.998 | 18.056 | 3.242 |
| 2.189690079552089 | 2.971 | 18.717 | 3.259 |
| 2.192831672205678 | 2.945 | 19.417 | 3.278 |
| 2.195973264859268 | 2.92 | 20.158 | 3.297 |
| 2.199114857512857 | 2.894 | 20.944 | 3.317 |
| 2.202256450166447 | 2.87 | 21.779 | 3.337 |
| 2.205398042820036 | 2.845 | 22.667 | 3.359 |
| 2.208539635473626 | 2.821 | 23.612 | 3.381 |
| 2.211681228127216 | 2.797 | 24.62 | 3.404 |
| 2.214822820780805 | 2.774 | 25.695 | 3.428 |
| 2.217964413434395 | 2.751 | 26.845 | 3.453 |
| 2.221106006087984 | 2.728 | 28.075 | 3.479 |
| 2.224247598741574 | 2.706 | 29.395 | 3.506 |
| 2.227389191395164 | 2.684 | 30.813 | 3.533 |
| 2.230530784048753 | 2.662 | 32.338 | 3.562 |
| 2.233672376702343 | 2.641 | 33.982 | 3.591 |
| 2.236813969355933 | 2.62 | 35.758 | 3.622 |
| 2.239955562009522 | 2.599 | 37.679 | 3.654 |
| 2.243097154663112 | 2.578 | 39.764 | 3.686 |
| 2.246238747316701 | 2.558 | 42.029 | 3.72 |
| 2.249380339970291 | 2.538 | 44.497 | 3.755 |
| 2.252521932623881 | 2.518 | 47.193 | 3.791 |
| 2.25566352527747 | 2.499 | 50.145 | 3.828 |
| 2.25880511793106 | 2.48 | 53.388 | 3.867 |
| 2.261946710584649 | 2.461 | 56.961 | 3.907 |
| 2.265088303238239 | 2.443 | 60.91 | 3.948 |
| 2.268229895891829 | 2.424 | 65.289 | 3.99 |
| 2.271371488545418 | 2.406 | 70.164 | 4.034 |
| 2.274513081199008 | 2.388 | 75.612 | 4.08 |
| 2.277654673852597 | 2.371 | 81.727 | 4.127 |
| 2.280796266506186 | 2.354 | 88.622 | 4.175 |
| 2.283937859159776 | 2.336 | 96.436 | 4.225 |
| 2.287079451813366 | 2.32 | 105.34 | 4.277 |
| 2.290221044466955 | 2.303 | 115.546 | 4.33 |
| 2.293362637120545 | 2.287 | 127.32 | 4.386 |
| 2.296504229774135 | 2.27 | 141.003 | 4.443 |
| 2.299645822427724 | 2.254 | 157.028 | 4.502 |
| 2.302787415081314 | 2.239 | 175.964 | 4.563 |
| 2.305929007734904 | 2.223 | 198.561 | 4.626 |
| 2.309070600388493 | 2.208 | 225.826 | 4.691 |
| 2.312212193042083 | 2.193 | 259.14 | 4.759 |
| 2.315353785695672 | 2.178 | 300.434 | 4.829 |
| 2.318495378349262 | 2.163 | 352.477 | 4.901 |
| 2.321636971002852 | 2.148 | 419.35 | 4.976 |
| 2.324778563656441 | 2.134 | 507.273 | 5.053 |
| 2.327920156310031 | 2.12 | 626.106 | 5.133 |
| 2.33106174896362 | 2.106 | 792.239 | 5.216 |
| 2.33420334161721 | 2.092 | 1034.557 | 5.302 |
| 2.3373449342708 | 2.078 | 1407.906 | 5.392 |
| 2.340486526924389 | 2.065 | 2027.09 | 5.484 |
| 2.343628119577979 | 2.052 | 3166.954 | 5.58 |
| 2.346769712231568 | 2.038 | 5629.621 | 5.679 |
| 2.349911304885158 | 2.025 | 12665.815 | 5.782 |
| 2.353052897538748 | 2.013 | 50661.258 | 5.889 |
| 2.356194490192337 | 2 | 8562958301394150430309613568 | 6 |
| 2.359336082845927 | 1.988 | 50661.258 | 6.115 |
| 2.362477675499516 | 1.975 | 12665.815 | 6.235 |
| 2.365619268153106 | 1.963 | 5629.621 | 6.359 |
| 2.368760860806696 | 1.951 | 3166.954 | 6.489 |
| 2.371902453460285 | 1.939 | 2027.09 | 6.623 |
| 2.375044046113875 | 1.927 | 1407.906 | 6.763 |
| 2.378185638767464 | 1.916 | 1034.557 | 6.909 |
| 2.381327231421054 | 1.904 | 792.239 | 7.061 |
| 2.384468824074644 | 1.893 | 626.106 | 7.219 |
| 2.387610416728233 | 1.882 | 507.273 | 7.384 |
| 2.390752009381823 | 1.871 | 419.35 | 7.555 |
| 2.393893602035412 | 1.86 | 352.477 | 7.735 |
| 2.397035194689002 | 1.849 | 300.434 | 7.922 |
| 2.400176787342591 | 1.838 | 259.14 | 8.117 |
| 2.403318379996181 | 1.828 | 225.826 | 8.322 |
| 2.406459972649771 | 1.818 | 198.561 | 8.535 |
| 2.40960156530336 | 1.807 | 175.964 | 8.759 |
| 2.41274315795695 | 1.797 | 157.028 | 8.993 |
| 2.41588475061054 | 1.787 | 141.003 | 9.238 |
| 2.419026343264129 | 1.777 | 127.32 | 9.496 |
| 2.422167935917719 | 1.767 | 115.546 | 9.765 |
| 2.425309528571308 | 1.758 | 105.34 | 10.049 |
| 2.428451121224898 | 1.748 | 96.436 | 10.346 |
| 2.431592713878488 | 1.739 | 88.622 | 10.659 |
| 2.434734306532077 | 1.729 | 81.727 | 10.989 |
| 2.437875899185667 | 1.72 | 75.612 | 11.336 |
| 2.441017491839256 | 1.711 | 70.164 | 11.702 |
| 2.444159084492846 | 1.702 | 65.289 | 12.088 |
| 2.447300677146435 | 1.693 | 60.91 | 12.495 |
| 2.450442269800025 | 1.684 | 56.961 | 12.926 |
| 2.453583862453615 | 1.676 | 53.388 | 13.382 |
| 2.456725455107204 | 1.667 | 50.145 | 13.865 |
| 2.459867047760794 | 1.659 | 47.193 | 14.378 |
| 2.463008640414384 | 1.65 | 44.497 | 14.922 |
| 2.466150233067973 | 1.642 | 42.029 | 15.5 |
| 2.469291825721563 | 1.634 | 39.764 | 16.116 |
| 2.472433418375152 | 1.626 | 37.679 | 16.772 |
| 2.475575011028742 | 1.617 | 35.758 | 17.472 |
| 2.478716603682332 | 1.61 | 33.982 | 18.22 |
| 2.481858196335921 | 1.602 | 32.338 | 19.02 |
| 2.48499978898951 | 1.594 | 30.813 | 19.878 |
| 2.4881413816431 | 1.586 | 29.395 | 20.8 |
| 2.49128297429669 | 1.579 | 28.075 | 21.791 |
| 2.49442456695028 | 1.571 | 26.845 | 22.858 |
| 2.497566159603869 | 1.564 | 25.695 | 24.011 |
| 2.500707752257458 | 1.556 | 24.62 | 25.257 |
| 2.503849344911048 | 1.549 | 23.612 | 26.608 |
| 2.506990937564638 | 1.542 | 22.667 | 28.075 |
| 2.510132530218228 | 1.535 | 21.779 | 29.673 |
| 2.513274122871817 | 1.528 | 20.944 | 31.416 |
| 2.516415715525407 | 1.521 | 20.158 | 33.324 |
| 2.519557308178996 | 1.514 | 19.417 | 35.418 |
| 2.522698900832586 | 1.507 | 18.717 | 37.723 |
| 2.525840493486176 | 1.501 | 18.056 | 40.267 |
| 2.528982086139765 | 1.494 | 17.43 | 43.086 |
| 2.532123678793355 | 1.487 | 16.838 | 46.219 |
| 2.535265271446944 | 1.481 | 16.277 | 49.717 |
| 2.538406864100534 | 1.474 | 15.744 | 53.637 |
| 2.541548456754124 | 1.468 | 15.239 | 58.05 |
| 2.544690049407713 | 1.462 | 14.758 | 63.043 |
| 2.547831642061302 | 1.456 | 14.301 | 68.722 |
| 2.550973234714892 | 1.45 | 13.867 | 75.218 |
| 2.554114827368482 | 1.443 | 13.452 | 82.696 |
| 2.557256420022072 | 1.437 | 13.057 | 91.364 |
| 2.560398012675661 | 1.431 | 12.68 | 101.49 |
| 2.563539605329251 | 1.426 | 12.32 | 113.418 |
| 2.56668119798284 | 1.42 | 11.976 | 127.603 |
| 2.56982279063643 | 1.414 | 11.648 | 144.654 |
| 2.57296438329002 | 1.408 | 11.333 | 165.397 |
| 2.576105975943609 | 1.403 | 11.032 | 190.98 |
| 2.579247568597199 | 1.397 | 10.744 | 223.036 |
| 2.582389161250788 | 1.392 | 10.467 | 263.947 |
| 2.585530753904377 | 1.386 | 10.202 | 317.301 |
| 2.588672346557967 | 1.381 | 9.948 | 388.71 |
| 2.591813939211557 | 1.376 | 9.704 | 487.343 |
| 2.594955531865147 | 1.37 | 9.469 | 629.025 |
| 2.598097124518736 | 1.365 | 9.244 | 843.005 |
| 2.601238717172326 | 1.36 | 9.027 | 1188.358 |
| 2.604380309825915 | 1.355 | 8.818 | 1799.601 |
| 2.607521902479505 | 1.35 | 8.617 | 3040.636 |
| 2.610663495133095 | 1.345 | 8.424 | 6204.338 |
| 2.613805087786684 | 1.34 | 8.238 | 18998.722 |
| 2.616946680440274 | 1.335 | 8.058 | 303964.551 |
| 2.620088273093863 | 1.33 | 7.885 | 75991.888 |
| 2.623229865747452 | 1.325 | 7.718 | 12159.542 |
| 2.626371458401042 | 1.321 | 7.557 | 4750.431 |
| 2.629513051054632 | 1.316 | 7.402 | 2513.096 |
| 2.632654643708222 | 1.311 | 7.251 | 1551.835 |
| 2.635796236361811 | 1.307 | 7.106 | 1052.778 |
| 2.638937829015401 | 1.302 | 6.966 | 760.91 |
| 2.642079421668991 | 1.298 | 6.83 | 575.601 |
| 2.64522101432258 | 1.293 | 6.699 | 450.652 |
| 2.64836260697617 | 1.289 | 6.572 | 362.433 |
| 2.651504199629759 | 1.285 | 6.449 | 297.841 |
| 2.654645792283349 | 1.28 | 6.33 | 249.136 |
| 2.657787384936938 | 1.276 | 6.215 | 211.504 |
| 2.660928977590528 | 1.272 | 6.104 | 181.826 |
| 2.664070570244118 | 1.268 | 5.995 | 158.01 |
| 2.667212162897707 | 1.264 | 5.891 | 138.607 |
| 2.670353755551297 | 1.26 | 5.789 | 122.59 |
| 2.673495348204887 | 1.256 | 5.69 | 109.216 |
| 2.676636940858476 | 1.252 | 5.595 | 97.933 |
| 2.679778533512066 | 1.248 | 5.502 | 88.328 |
| 2.682920126165655 | 1.244 | 5.412 | 80.082 |
| 2.686061718819245 | 1.24 | 5.324 | 72.952 |
| 2.689203311472835 | 1.236 | 5.239 | 66.745 |
| 2.692344904126424 | 1.232 | 5.156 | 61.308 |
| 2.695486496780014 | 1.229 | 5.076 | 56.519 |
| 2.698628089433603 | 1.225 | 4.998 | 52.279 |
| 2.701769682087193 | 1.221 | 4.922 | 48.507 |
| 2.704911274740782 | 1.218 | 4.849 | 45.137 |
| 2.708052867394372 | 1.214 | 4.777 | 42.113 |
| 2.711194460047962 | 1.211 | 4.707 | 39.39 |
| 2.714336052701551 | 1.207 | 4.639 | 36.929 |
| 2.717477645355141 | 1.204 | 4.573 | 34.698 |
| 2.720619238008731 | 1.2 | 4.509 | 32.669 |
| 2.72376083066232 | 1.197 | 4.446 | 30.818 |
| 2.72690242331591 | 1.194 | 4.385 | 29.125 |
| 2.730044015969499 | 1.191 | 4.326 | 27.572 |
| 2.733185608623089 | 1.187 | 4.268 | 26.145 |
| 2.736327201276678 | 1.184 | 4.212 | 24.831 |
| 2.739468793930268 | 1.181 | 4.157 | 23.617 |
| 2.742610386583858 | 1.178 | 4.103 | 22.493 |
| 2.745751979237447 | 1.175 | 4.051 | 21.452 |
| 2.748893571891036 | 1.172 | 4 | 20.485 |
| 2.752035164544627 | 1.169 | 3.95 | 19.586 |
| 2.755176757198216 | 1.166 | 3.902 | 18.747 |
| 2.758318349851806 | 1.163 | 3.855 | 17.965 |
| 2.761459942505395 | 1.16 | 3.809 | 17.233 |
| 2.764601535158985 | 1.157 | 3.764 | 16.548 |
| 2.767743127812574 | 1.154 | 3.72 | 15.906 |
| 2.770884720466164 | 1.151 | 3.677 | 15.303 |
| 2.774026313119754 | 1.148 | 3.635 | 14.737 |
| 2.777167905773343 | 1.146 | 3.594 | 14.204 |
| 2.780309498426932 | 1.143 | 3.555 | 13.701 |
| 2.783451091080522 | 1.14 | 3.516 | 13.227 |
| 2.786592683734112 | 1.137 | 3.478 | 12.78 |
| 2.789734276387701 | 1.135 | 3.44 | 12.357 |
| 2.792875869041291 | 1.132 | 3.404 | 11.957 |
| 2.796017461694881 | 1.13 | 3.369 | 11.578 |
| 2.79915905434847 | 1.127 | 3.334 | 11.218 |
| 2.80230064700206 | 1.125 | 3.3 | 10.877 |
| 2.80544223965565 | 1.122 | 3.267 | 10.553 |
| 2.808583832309239 | 1.12 | 3.235 | 10.245 |
| 2.811725424962829 | 1.117 | 3.203 | 9.953 |
| 2.814867017616419 | 1.115 | 3.172 | 9.674 |
| 2.818008610270008 | 1.112 | 3.142 | 9.408 |
| 2.821150202923598 | 1.11 | 3.113 | 9.155 |
| 2.824291795577187 | 1.108 | 3.084 | 8.914 |
| 2.827433388230777 | 1.106 | 3.056 | 8.683 |
| 2.830574980884366 | 1.103 | 3.028 | 8.463 |
| 2.833716573537956 | 1.101 | 3.001 | 8.253 |
| 2.836858166191546 | 1.099 | 2.975 | 8.051 |
| 2.839999758845135 | 1.097 | 2.949 | 7.859 |
| 2.843141351498725 | 1.095 | 2.924 | 7.674 |
| 2.846282944152314 | 1.093 | 2.899 | 7.497 |
| 2.849424536805904 | 1.09 | 2.875 | 7.328 |
| 2.852566129459494 | 1.088 | 2.851 | 7.165 |
| 2.855707722113083 | 1.086 | 2.828 | 7.009 |
| 2.858849314766673 | 1.084 | 2.805 | 6.86 |
| 2.861990907420262 | 1.082 | 2.783 | 6.716 |
| 2.865132500073852 | 1.081 | 2.762 | 6.578 |
| 2.868274092727442 | 1.079 | 2.741 | 6.445 |
| 2.871415685381031 | 1.077 | 2.72 | 6.317 |
| 2.874557278034621 | 1.075 | 2.7 | 6.195 |
| 2.87769887068821 | 1.073 | 2.68 | 6.076 |
| 2.8808404633418 | 1.071 | 2.66 | 5.963 |
| 2.88398205599539 | 1.069 | 2.641 | 5.853 |
| 2.88712364864898 | 1.068 | 2.623 | 5.747 |
| 2.890265241302569 | 1.066 | 2.604 | 5.646 |
| 2.893406833956158 | 1.064 | 2.587 | 5.547 |
| 2.896548426609748 | 1.063 | 2.569 | 5.453 |
| 2.899690019263338 | 1.061 | 2.552 | 5.361 |
| 2.902831611916927 | 1.059 | 2.536 | 5.273 |
| 2.905973204570517 | 1.058 | 2.519 | 5.188 |
| 2.909114797224106 | 1.056 | 2.503 | 5.106 |
| 2.912256389877696 | 1.054 | 2.488 | 5.027 |
| 2.915397982531286 | 1.053 | 2.472 | 4.95 |
| 2.918539575184875 | 1.051 | 2.457 | 4.877 |
| 2.921681167838465 | 1.05 | 2.443 | 4.805 |
| 2.924822760492054 | 1.049 | 2.429 | 4.736 |
| 2.927964353145644 | 1.047 | 2.415 | 4.669 |
| 2.931105945799234 | 1.046 | 2.401 | 4.605 |
| 2.934247538452823 | 1.044 | 2.388 | 4.542 |
| 2.937389131106413 | 1.043 | 2.375 | 4.482 |
| 2.940530723760002 | 1.042 | 2.362 | 4.423 |
| 2.943672316413592 | 1.04 | 2.349 | 4.367 |
| 2.946813909067182 | 1.039 | 2.337 | 4.312 |
| 2.949955501720771 | 1.038 | 2.325 | 4.259 |
| 2.953097094374361 | 1.036 | 2.314 | 4.208 |
| 2.95623868702795 | 1.035 | 2.302 | 4.159 |
| 2.95938027968154 | 1.034 | 2.291 | 4.111 |
| 2.96252187233513 | 1.033 | 2.28 | 4.064 |
| 2.965663464988719 | 1.032 | 2.27 | 4.019 |
| 2.968805057642309 | 1.03 | 2.259 | 3.976 |
| 2.971946650295898 | 1.029 | 2.249 | 3.934 |
| 2.975088242949488 | 1.028 | 2.239 | 3.893 |
| 2.978229835603078 | 1.027 | 2.23 | 3.854 |
| 2.981371428256667 | 1.026 | 2.22 | 3.816 |
| 2.984513020910257 | 1.025 | 2.211 | 3.779 |
| 2.987654613563846 | 1.024 | 2.202 | 3.743 |
| 2.990796206217436 | 1.023 | 2.194 | 3.709 |
| 2.993937798871025 | 1.022 | 2.185 | 3.675 |
| 2.997079391524615 | 1.021 | 2.177 | 3.643 |
| 3.000220984178205 | 1.02 | 2.169 | 3.612 |
| 3.003362576831794 | 1.019 | 2.161 | 3.581 |
| 3.006504169485384 | 1.018 | 2.153 | 3.552 |
| 3.009645762138974 | 1.018 | 2.146 | 3.524 |
| 3.012787354792563 | 1.017 | 2.139 | 3.497 |
| 3.015928947446153 | 1.016 | 2.132 | 3.47 |
| 3.019070540099742 | 1.015 | 2.125 | 3.445 |
| 3.022212132753332 | 1.014 | 2.118 | 3.42 |
| 3.025353725406922 | 1.014 | 2.112 | 3.397 |
| 3.028495318060511 | 1.013 | 2.106 | 3.374 |
| 3.031636910714101 | 1.012 | 2.1 | 3.352 |
| 3.03477850336769 | 1.011 | 2.094 | 3.33 |
| 3.03792009602128 | 1.011 | 2.089 | 3.31 |
| 3.04106168867487 | 1.01 | 2.083 | 3.29 |
| 3.04420328132846 | 1.01 | 2.078 | 3.271 |
| 3.047344873982049 | 1.009 | 2.073 | 3.253 |
| 3.050486466635638 | 1.008 | 2.068 | 3.236 |
| 3.053628059289228 | 1.008 | 2.063 | 3.219 |
| 3.056769651942818 | 1.007 | 2.059 | 3.203 |
| 3.059911244596407 | 1.007 | 2.054 | 3.188 |
| 3.063052837249997 | 1.006 | 2.05 | 3.173 |
| 3.066194429903586 | 1.006 | 2.046 | 3.159 |
| 3.069336022557176 | 1.005 | 2.042 | 3.146 |
| 3.072477615210766 | 1.005 | 2.039 | 3.133 |
| 3.075619207864355 | 1.004 | 2.035 | 3.121 |
| 3.078760800517945 | 1.004 | 2.032 | 3.109 |
| 3.081902393171534 | 1.004 | 2.029 | 3.098 |
| 3.085043985825124 | 1.003 | 2.026 | 3.088 |
| 3.088185578478713 | 1.003 | 2.023 | 3.078 |
| 3.091327171132303 | 1.003 | 2.02 | 3.069 |
| 3.094468763785893 | 1.002 | 2.018 | 3.061 |
| 3.097610356439482 | 1.002 | 2.016 | 3.053 |
| 3.100751949093072 | 1.002 | 2.013 | 3.045 |
| 3.103893541746661 | 1.001 | 2.011 | 3.039 |
| 3.107035134400251 | 1.001 | 2.01 | 3.032 |
| 3.110176727053841 | 1.001 | 2.008 | 3.027 |
| 3.11331831970743 | 1.001 | 2.006 | 3.022 |
| 3.11645991236102 | 1.001 | 2.005 | 3.017 |
| 3.11960150501461 | 1 | 2.004 | 3.013 |
| 3.122743097668199 | 1 | 2.003 | 3.01 |
| 3.125884690321789 | 1 | 2.002 | 3.007 |
| 3.129026282975378 | 1 | 2.001 | 3.004 |
| 3.132167875628968 | 1 | 2.001 | 3.002 |
| 3.135309468282557 | 1 | 2 | 3.001 |
| 3.138451060936147 | 1 | 2 | 3 |
| 3.141592653589737 | 1 | 2 | 3 |
| 3.144734246243326 | 1 | 2 | 3 |
| 3.147875838896916 | 1 | 2 | 3.001 |
| 3.151017431550505 | 1 | 2.001 | 3.002 |
| 3.154159024204095 | 1 | 2.001 | 3.004 |
| 3.157300616857685 | 1 | 2.002 | 3.007 |
| 3.160442209511274 | 1 | 2.003 | 3.01 |
| 3.163583802164864 | 1 | 2.004 | 3.013 |
| 3.166725394818453 | 1.001 | 2.005 | 3.017 |
| 3.169866987472043 | 1.001 | 2.006 | 3.022 |
| 3.173008580125633 | 1.001 | 2.008 | 3.027 |
| 3.176150172779222 | 1.001 | 2.01 | 3.032 |
| 3.179291765432812 | 1.001 | 2.011 | 3.039 |
| 3.182433358086401 | 1.002 | 2.013 | 3.045 |
| 3.185574950739991 | 1.002 | 2.016 | 3.053 |
| 3.188716543393581 | 1.002 | 2.018 | 3.061 |
| 3.19185813604717 | 1.003 | 2.02 | 3.069 |
| 3.19499972870076 | 1.003 | 2.023 | 3.078 |
| 3.198141321354349 | 1.003 | 2.026 | 3.088 |
| 3.20128291400794 | 1.004 | 2.029 | 3.098 |
| 3.204424506661528 | 1.004 | 2.032 | 3.109 |
| 3.207566099315118 | 1.004 | 2.035 | 3.121 |
| 3.210707691968708 | 1.005 | 2.039 | 3.133 |
| 3.213849284622297 | 1.005 | 2.042 | 3.146 |
| 3.216990877275887 | 1.006 | 2.046 | 3.159 |
| 3.220132469929476 | 1.006 | 2.05 | 3.173 |
| 3.223274062583066 | 1.007 | 2.054 | 3.188 |
| 3.226415655236656 | 1.007 | 2.059 | 3.203 |
| 3.229557247890245 | 1.008 | 2.063 | 3.219 |
| 3.232698840543835 | 1.008 | 2.068 | 3.236 |
| 3.235840433197425 | 1.009 | 2.073 | 3.253 |
| 3.238982025851014 | 1.01 | 2.078 | 3.271 |
| 3.242123618504604 | 1.01 | 2.083 | 3.29 |
| 3.245265211158193 | 1.011 | 2.089 | 3.31 |
| 3.248406803811783 | 1.011 | 2.094 | 3.33 |
| 3.251548396465373 | 1.012 | 2.1 | 3.352 |
| 3.254689989118962 | 1.013 | 2.106 | 3.374 |
| 3.257831581772551 | 1.014 | 2.112 | 3.397 |
| 3.260973174426141 | 1.014 | 2.118 | 3.42 |
| 3.26411476707973 | 1.015 | 2.125 | 3.445 |
| 3.267256359733321 | 1.016 | 2.132 | 3.47 |
| 3.27039795238691 | 1.017 | 2.139 | 3.497 |
| 3.2735395450405 | 1.018 | 2.146 | 3.524 |
| 3.276681137694089 | 1.018 | 2.153 | 3.552 |
| 3.279822730347679 | 1.019 | 2.161 | 3.581 |
| 3.282964323001269 | 1.02 | 2.169 | 3.612 |
| 3.286105915654858 | 1.021 | 2.177 | 3.643 |
| 3.289247508308448 | 1.022 | 2.185 | 3.675 |
| 3.292389100962037 | 1.023 | 2.194 | 3.709 |
| 3.295530693615627 | 1.024 | 2.202 | 3.743 |
| 3.298672286269217 | 1.025 | 2.211 | 3.779 |
| 3.301813878922806 | 1.026 | 2.22 | 3.816 |
| 3.304955471576396 | 1.027 | 2.23 | 3.854 |
| 3.308097064229985 | 1.028 | 2.239 | 3.893 |
| 3.311238656883575 | 1.029 | 2.249 | 3.934 |
| 3.314380249537165 | 1.03 | 2.259 | 3.976 |
| 3.317521842190754 | 1.032 | 2.27 | 4.019 |
| 3.320663434844344 | 1.033 | 2.28 | 4.064 |
| 3.323805027497933 | 1.034 | 2.291 | 4.111 |
| 3.326946620151523 | 1.035 | 2.302 | 4.159 |
| 3.330088212805113 | 1.036 | 2.314 | 4.208 |
| 3.333229805458702 | 1.038 | 2.325 | 4.259 |
| 3.336371398112292 | 1.039 | 2.337 | 4.312 |
| 3.339512990765881 | 1.04 | 2.349 | 4.367 |
| 3.342654583419471 | 1.042 | 2.362 | 4.423 |
| 3.345796176073061 | 1.043 | 2.375 | 4.482 |
| 3.34893776872665 | 1.044 | 2.388 | 4.542 |
| 3.35207936138024 | 1.046 | 2.401 | 4.605 |
| 3.355220954033829 | 1.047 | 2.415 | 4.669 |
| 3.358362546687419 | 1.049 | 2.429 | 4.736 |
| 3.361504139341009 | 1.05 | 2.443 | 4.805 |
| 3.364645731994598 | 1.051 | 2.457 | 4.877 |
| 3.367787324648188 | 1.053 | 2.472 | 4.95 |
| 3.370928917301777 | 1.054 | 2.488 | 5.027 |
| 3.374070509955367 | 1.056 | 2.503 | 5.106 |
| 3.377212102608956 | 1.058 | 2.519 | 5.188 |
| 3.380353695262546 | 1.059 | 2.536 | 5.273 |
| 3.383495287916136 | 1.061 | 2.552 | 5.361 |
| 3.386636880569725 | 1.063 | 2.569 | 5.453 |
| 3.389778473223315 | 1.064 | 2.587 | 5.547 |
| 3.392920065876904 | 1.066 | 2.604 | 5.646 |
| 3.396061658530494 | 1.068 | 2.623 | 5.747 |
| 3.399203251184084 | 1.069 | 2.641 | 5.853 |
| 3.402344843837673 | 1.071 | 2.66 | 5.963 |
| 3.405486436491263 | 1.073 | 2.68 | 6.076 |
| 3.408628029144852 | 1.075 | 2.7 | 6.195 |
| 3.411769621798442 | 1.077 | 2.72 | 6.317 |
| 3.414911214452032 | 1.079 | 2.741 | 6.445 |
| 3.418052807105621 | 1.081 | 2.762 | 6.578 |
| 3.421194399759211 | 1.082 | 2.783 | 6.716 |
| 3.4243359924128 | 1.084 | 2.805 | 6.86 |
| 3.42747758506639 | 1.086 | 2.828 | 7.009 |
| 3.43061917771998 | 1.088 | 2.851 | 7.165 |
| 3.433760770373569 | 1.09 | 2.875 | 7.328 |
| 3.436902363027159 | 1.093 | 2.899 | 7.497 |
| 3.440043955680748 | 1.095 | 2.924 | 7.674 |
| 3.443185548334338 | 1.097 | 2.949 | 7.859 |
| 3.446327140987927 | 1.099 | 2.975 | 8.051 |
| 3.449468733641517 | 1.101 | 3.001 | 8.253 |
| 3.452610326295107 | 1.103 | 3.028 | 8.463 |
| 3.455751918948696 | 1.106 | 3.056 | 8.683 |
| 3.458893511602286 | 1.108 | 3.084 | 8.914 |
| 3.462035104255876 | 1.11 | 3.113 | 9.155 |
| 3.465176696909465 | 1.112 | 3.142 | 9.408 |
| 3.468318289563055 | 1.115 | 3.172 | 9.674 |
| 3.471459882216644 | 1.117 | 3.203 | 9.953 |
| 3.474601474870234 | 1.12 | 3.235 | 10.245 |
| 3.477743067523824 | 1.122 | 3.267 | 10.553 |
| 3.480884660177413 | 1.125 | 3.3 | 10.877 |
| 3.484026252831002 | 1.127 | 3.334 | 11.218 |
| 3.487167845484592 | 1.13 | 3.369 | 11.578 |
| 3.490309438138182 | 1.132 | 3.404 | 11.957 |
| 3.493451030791772 | 1.135 | 3.44 | 12.357 |
| 3.496592623445361 | 1.137 | 3.478 | 12.78 |
| 3.499734216098951 | 1.14 | 3.516 | 13.227 |
| 3.50287580875254 | 1.143 | 3.555 | 13.701 |
| 3.50601740140613 | 1.146 | 3.594 | 14.204 |
| 3.50915899405972 | 1.148 | 3.635 | 14.737 |
| 3.512300586713309 | 1.151 | 3.677 | 15.303 |
| 3.515442179366899 | 1.154 | 3.72 | 15.906 |
| 3.518583772020488 | 1.157 | 3.764 | 16.548 |
| 3.521725364674078 | 1.16 | 3.809 | 17.233 |
| 3.524866957327668 | 1.163 | 3.855 | 17.965 |
| 3.528008549981257 | 1.166 | 3.902 | 18.747 |
| 3.531150142634847 | 1.169 | 3.95 | 19.586 |
| 3.534291735288436 | 1.172 | 4 | 20.485 |
| 3.537433327942026 | 1.175 | 4.051 | 21.452 |
| 3.540574920595616 | 1.178 | 4.103 | 22.493 |
| 3.543716513249205 | 1.181 | 4.157 | 23.617 |
| 3.546858105902795 | 1.184 | 4.212 | 24.831 |
| 3.549999698556384 | 1.187 | 4.268 | 26.145 |
| 3.553141291209974 | 1.191 | 4.326 | 27.572 |
| 3.556282883863564 | 1.194 | 4.385 | 29.125 |
| 3.559424476517153 | 1.197 | 4.446 | 30.818 |
| 3.562566069170743 | 1.2 | 4.509 | 32.669 |
| 3.565707661824332 | 1.204 | 4.573 | 34.698 |
| 3.568849254477922 | 1.207 | 4.639 | 36.929 |
| 3.571990847131511 | 1.211 | 4.707 | 39.39 |
| 3.575132439785101 | 1.214 | 4.777 | 42.113 |
| 3.578274032438691 | 1.218 | 4.849 | 45.137 |
| 3.58141562509228 | 1.221 | 4.922 | 48.507 |
| 3.58455721774587 | 1.225 | 4.998 | 52.279 |
| 3.58769881039946 | 1.229 | 5.076 | 56.519 |
| 3.590840403053049 | 1.232 | 5.156 | 61.308 |
| 3.593981995706639 | 1.236 | 5.239 | 66.745 |
| 3.597123588360228 | 1.24 | 5.324 | 72.952 |
| 3.600265181013818 | 1.244 | 5.412 | 80.082 |
| 3.603406773667407 | 1.248 | 5.502 | 88.328 |
| 3.606548366320997 | 1.252 | 5.595 | 97.933 |
| 3.609689958974587 | 1.256 | 5.69 | 109.216 |
| 3.612831551628176 | 1.26 | 5.789 | 122.59 |
| 3.615973144281766 | 1.264 | 5.891 | 138.607 |
| 3.619114736935355 | 1.268 | 5.995 | 158.01 |
| 3.622256329588945 | 1.272 | 6.104 | 181.826 |
| 3.625397922242534 | 1.276 | 6.215 | 211.504 |
| 3.628539514896124 | 1.28 | 6.33 | 249.136 |
| 3.631681107549714 | 1.285 | 6.449 | 297.841 |
| 3.634822700203303 | 1.289 | 6.572 | 362.433 |
| 3.637964292856893 | 1.293 | 6.699 | 450.652 |
| 3.641105885510483 | 1.298 | 6.83 | 575.601 |
| 3.644247478164072 | 1.302 | 6.966 | 760.91 |
| 3.647389070817662 | 1.307 | 7.106 | 1052.778 |
| 3.650530663471251 | 1.311 | 7.251 | 1551.835 |
| 3.653672256124841 | 1.316 | 7.402 | 2513.096 |
| 3.656813848778431 | 1.321 | 7.557 | 4750.431 |
| 3.65995544143202 | 1.325 | 7.718 | 12159.542 |
| 3.66309703408561 | 1.33 | 7.885 | 75991.888 |
| 3.666238626739199 | 1.335 | 8.058 | 303964.551 |
| 3.66938021939279 | 1.34 | 8.238 | 18998.722 |
| 3.672521812046378 | 1.345 | 8.424 | 6204.338 |
| 3.675663404699968 | 1.35 | 8.617 | 3040.636 |
| 3.678804997353558 | 1.355 | 8.818 | 1799.601 |
| 3.681946590007147 | 1.36 | 9.027 | 1188.358 |
| 3.685088182660737 | 1.365 | 9.244 | 843.005 |
| 3.688229775314326 | 1.37 | 9.469 | 629.025 |
| 3.691371367967916 | 1.376 | 9.704 | 487.343 |
| 3.694512960621506 | 1.381 | 9.948 | 388.71 |
| 3.697654553275095 | 1.386 | 10.202 | 317.301 |
| 3.700796145928685 | 1.392 | 10.467 | 263.947 |
| 3.703937738582274 | 1.397 | 10.744 | 223.036 |
| 3.707079331235864 | 1.403 | 11.032 | 190.98 |
| 3.710220923889454 | 1.408 | 11.333 | 165.397 |
| 3.713362516543043 | 1.414 | 11.648 | 144.654 |
| 3.716504109196633 | 1.42 | 11.976 | 127.603 |
| 3.719645701850223 | 1.426 | 12.32 | 113.418 |
| 3.722787294503812 | 1.431 | 12.68 | 101.49 |
| 3.725928887157402 | 1.437 | 13.057 | 91.364 |
| 3.729070479810991 | 1.443 | 13.452 | 82.696 |
| 3.732212072464581 | 1.45 | 13.867 | 75.218 |
| 3.735353665118171 | 1.456 | 14.301 | 68.722 |
| 3.73849525777176 | 1.462 | 14.758 | 63.043 |
| 3.74163685042535 | 1.468 | 15.239 | 58.05 |
| 3.744778443078939 | 1.474 | 15.744 | 53.637 |
| 3.747920035732529 | 1.481 | 16.277 | 49.717 |
| 3.751061628386119 | 1.487 | 16.838 | 46.219 |
| 3.754203221039708 | 1.494 | 17.43 | 43.086 |
| 3.757344813693298 | 1.501 | 18.056 | 40.267 |
| 3.760486406346887 | 1.507 | 18.717 | 37.723 |
| 3.763627999000477 | 1.514 | 19.417 | 35.418 |
| 3.766769591654067 | 1.521 | 20.158 | 33.324 |
| 3.769911184307656 | 1.528 | 20.944 | 31.416 |
| 3.773052776961246 | 1.535 | 21.779 | 29.673 |
| 3.776194369614835 | 1.542 | 22.667 | 28.075 |
| 3.779335962268425 | 1.549 | 23.612 | 26.608 |
| 3.782477554922014 | 1.556 | 24.62 | 25.257 |
| 3.785619147575604 | 1.564 | 25.695 | 24.011 |
| 3.788760740229193 | 1.571 | 26.845 | 22.858 |
| 3.791902332882783 | 1.579 | 28.075 | 21.791 |
| 3.795043925536373 | 1.586 | 29.395 | 20.8 |
| 3.798185518189962 | 1.594 | 30.813 | 19.878 |
| 3.801327110843552 | 1.602 | 32.338 | 19.02 |
| 3.804468703497142 | 1.61 | 33.982 | 18.22 |
| 3.807610296150731 | 1.617 | 35.758 | 17.472 |
| 3.810751888804321 | 1.626 | 37.679 | 16.772 |
| 3.813893481457911 | 1.634 | 39.764 | 16.116 |
| 3.8170350741115 | 1.642 | 42.029 | 15.5 |
| 3.82017666676509 | 1.65 | 44.497 | 14.922 |
| 3.823318259418679 | 1.659 | 47.193 | 14.378 |
| 3.826459852072269 | 1.667 | 50.145 | 13.865 |
| 3.829601444725859 | 1.676 | 53.388 | 13.382 |
| 3.832743037379448 | 1.684 | 56.961 | 12.926 |
| 3.835884630033038 | 1.693 | 60.91 | 12.495 |
| 3.839026222686627 | 1.702 | 65.289 | 12.088 |
| 3.842167815340217 | 1.711 | 70.164 | 11.702 |
| 3.845309407993807 | 1.72 | 75.612 | 11.336 |
| 3.848451000647396 | 1.729 | 81.727 | 10.989 |
| 3.851592593300986 | 1.739 | 88.622 | 10.659 |
| 3.854734185954575 | 1.748 | 96.436 | 10.346 |
| 3.857875778608165 | 1.758 | 105.34 | 10.049 |
| 3.861017371261755 | 1.767 | 115.546 | 9.765 |
| 3.864158963915344 | 1.777 | 127.32 | 9.496 |
| 3.867300556568933 | 1.787 | 141.003 | 9.238 |
| 3.870442149222523 | 1.797 | 157.028 | 8.993 |
| 3.873583741876112 | 1.807 | 175.964 | 8.759 |
| 3.876725334529703 | 1.818 | 198.561 | 8.535 |
| 3.879866927183292 | 1.828 | 225.826 | 8.322 |
| 3.883008519836882 | 1.838 | 259.14 | 8.117 |
| 3.886150112490471 | 1.849 | 300.434 | 7.922 |
| 3.889291705144061 | 1.86 | 352.477 | 7.735 |
| 3.892433297797651 | 1.871 | 419.35 | 7.555 |
| 3.89557489045124 | 1.882 | 507.273 | 7.384 |
| 3.89871648310483 | 1.893 | 626.106 | 7.219 |
| 3.901858075758419 | 1.904 | 792.239 | 7.061 |
| 3.904999668412009 | 1.916 | 1034.557 | 6.909 |
| 3.908141261065598 | 1.927 | 1407.906 | 6.763 |
| 3.911282853719188 | 1.939 | 2027.09 | 6.623 |
| 3.914424446372778 | 1.951 | 3166.954 | 6.489 |
| 3.917566039026367 | 1.963 | 5629.621 | 6.359 |
| 3.920707631679957 | 1.975 | 12665.815 | 6.235 |
| 3.923849224333547 | 1.988 | 50661.258 | 6.115 |
| 3.926990816987136 | 2 | 45005950867318996356562944 | 6 |
| 3.930132409640726 | 2.013 | 50661.258 | 5.889 |
| 3.933274002294315 | 2.025 | 12665.815 | 5.782 |
| 3.936415594947905 | 2.038 | 5629.621 | 5.679 |
| 3.939557187601495 | 2.052 | 3166.954 | 5.58 |
| 3.942698780255084 | 2.065 | 2027.09 | 5.484 |
| 3.945840372908674 | 2.078 | 1407.906 | 5.392 |
| 3.948981965562263 | 2.092 | 1034.557 | 5.302 |
| 3.952123558215853 | 2.106 | 792.239 | 5.216 |
| 3.955265150869442 | 2.12 | 626.106 | 5.133 |
| 3.958406743523032 | 2.134 | 507.273 | 5.053 |
| 3.961548336176622 | 2.148 | 419.35 | 4.976 |
| 3.964689928830211 | 2.163 | 352.477 | 4.901 |
| 3.967831521483801 | 2.178 | 300.434 | 4.829 |
| 3.97097311413739 | 2.193 | 259.14 | 4.759 |
| 3.97411470679098 | 2.208 | 225.826 | 4.691 |
| 3.97725629944457 | 2.223 | 198.561 | 4.626 |
| 3.98039789209816 | 2.239 | 175.964 | 4.563 |
| 3.983539484751749 | 2.254 | 157.028 | 4.502 |
| 3.986681077405338 | 2.27 | 141.003 | 4.443 |
| 3.989822670058928 | 2.287 | 127.32 | 4.386 |
| 3.992964262712517 | 2.303 | 115.546 | 4.33 |
| 3.996105855366107 | 2.32 | 105.34 | 4.277 |
| 3.999247448019697 | 2.336 | 96.436 | 4.225 |
| 4.002389040673287 | 2.354 | 88.622 | 4.175 |
| 4.005530633326877 | 2.371 | 81.727 | 4.127 |
| 4.008672225980466 | 2.388 | 75.612 | 4.08 |
| 4.011813818634056 | 2.406 | 70.164 | 4.034 |
| 4.014955411287645 | 2.424 | 65.289 | 3.99 |
| 4.018097003941234 | 2.443 | 60.91 | 3.948 |
| 4.021238596594824 | 2.461 | 56.961 | 3.907 |
| 4.024380189248414 | 2.48 | 53.388 | 3.867 |
| 4.027521781902004 | 2.499 | 50.145 | 3.828 |
| 4.030663374555593 | 2.518 | 47.193 | 3.791 |
| 4.033804967209183 | 2.538 | 44.497 | 3.755 |
| 4.036946559862773 | 2.558 | 42.029 | 3.72 |
| 4.040088152516362 | 2.578 | 39.764 | 3.686 |
| 4.043229745169951 | 2.599 | 37.679 | 3.654 |
| 4.046371337823541 | 2.62 | 35.758 | 3.622 |
| 4.049512930477131 | 2.641 | 33.982 | 3.591 |
| 4.05265452313072 | 2.662 | 32.338 | 3.562 |
| 4.05579611578431 | 2.684 | 30.813 | 3.533 |
| 4.0589377084379 | 2.706 | 29.395 | 3.506 |
| 4.062079301091489 | 2.728 | 28.075 | 3.479 |
| 4.065220893745079 | 2.751 | 26.845 | 3.453 |
| 4.068362486398668 | 2.774 | 25.695 | 3.428 |
| 4.071504079052258 | 2.797 | 24.62 | 3.404 |
| 4.074645671705848 | 2.821 | 23.612 | 3.381 |
| 4.077787264359437 | 2.845 | 22.667 | 3.359 |
| 4.080928857013027 | 2.87 | 21.779 | 3.337 |
| 4.084070449666616 | 2.894 | 20.944 | 3.317 |
| 4.087212042320206 | 2.92 | 20.158 | 3.297 |
| 4.090353634973795 | 2.945 | 19.417 | 3.278 |
| 4.093495227627385 | 2.971 | 18.717 | 3.259 |
| 4.096636820280975 | 2.998 | 18.056 | 3.242 |
| 4.099778412934564 | 3.025 | 17.43 | 3.225 |
| 4.102920005588154 | 3.052 | 16.838 | 3.208 |
| 4.106061598241744 | 3.079 | 16.277 | 3.193 |
| 4.109203190895333 | 3.108 | 15.744 | 3.178 |
| 4.112344783548923 | 3.136 | 15.239 | 3.163 |
| 4.115486376202512 | 3.165 | 14.758 | 3.15 |
| 4.118627968856102 | 3.195 | 14.301 | 3.137 |
| 4.121769561509692 | 3.225 | 13.867 | 3.125 |
| 4.124911154163281 | 3.255 | 13.452 | 3.113 |
| 4.128052746816871 | 3.286 | 13.057 | 3.102 |
| 4.13119433947046 | 3.318 | 12.68 | 3.091 |
| 4.13433593212405 | 3.35 | 12.32 | 3.082 |
| 4.13747752477764 | 3.382 | 11.976 | 3.072 |
| 4.14061911743123 | 3.415 | 11.648 | 3.064 |
| 4.143760710084818 | 3.449 | 11.333 | 3.055 |
| 4.146902302738408 | 3.483 | 11.032 | 3.048 |
| 4.150043895391998 | 3.518 | 10.744 | 3.041 |
| 4.153185488045588 | 3.553 | 10.467 | 3.034 |
| 4.156327080699177 | 3.589 | 10.202 | 3.029 |
| 4.159468673352766 | 3.626 | 9.948 | 3.023 |
| 4.162610266006356 | 3.663 | 9.704 | 3.019 |
| 4.165751858659946 | 3.701 | 9.469 | 3.014 |
| 4.168893451313535 | 3.739 | 9.244 | 3.011 |
| 4.172035043967125 | 3.779 | 9.027 | 3.008 |
| 4.175176636620715 | 3.819 | 8.818 | 3.005 |
| 4.178318229274304 | 3.859 | 8.617 | 3.003 |
| 4.181459821927894 | 3.901 | 8.424 | 3.001 |
| 4.184601414581484 | 3.943 | 8.238 | 3 |
| 4.187743007235073 | 3.986 | 8.058 | 3 |
| 4.190884599888663 | 4.029 | 7.885 | 3 |
| 4.194026192542252 | 4.074 | 7.718 | 3.001 |
| 4.197167785195842 | 4.119 | 7.557 | 3.002 |
| 4.200309377849432 | 4.165 | 7.402 | 3.004 |
| 4.203450970503021 | 4.212 | 7.251 | 3.006 |
| 4.206592563156611 | 4.26 | 7.106 | 3.009 |
| 4.2097341558102 | 4.309 | 6.966 | 3.012 |
| 4.21287574846379 | 4.358 | 6.83 | 3.016 |
| 4.21601734111738 | 4.409 | 6.699 | 3.02 |
| 4.21915893377097 | 4.461 | 6.572 | 3.025 |
| 4.222300526424559 | 4.513 | 6.449 | 3.031 |
| 4.225442119078148 | 4.567 | 6.33 | 3.037 |
| 4.228583711731738 | 4.622 | 6.215 | 3.043 |
| 4.231725304385327 | 4.678 | 6.104 | 3.05 |
| 4.234866897038917 | 4.735 | 5.995 | 3.058 |
| 4.238008489692506 | 4.793 | 5.891 | 3.066 |
| 4.241150082346096 | 4.852 | 5.789 | 3.075 |
| 4.244291674999685 | 4.912 | 5.69 | 3.085 |
| 4.247433267653276 | 4.974 | 5.595 | 3.095 |
| 4.250574860306865 | 5.037 | 5.502 | 3.105 |
| 4.253716452960455 | 5.101 | 5.412 | 3.117 |
| 4.256858045614044 | 5.167 | 5.324 | 3.129 |
| 4.259999638267634 | 5.234 | 5.239 | 3.141 |
| 4.263141230921224 | 5.302 | 5.156 | 3.154 |
| 4.266282823574813 | 5.372 | 5.076 | 3.168 |
| 4.269424416228403 | 5.443 | 4.998 | 3.183 |
| 4.272566008881992 | 5.516 | 4.922 | 3.198 |
| 4.275707601535582 | 5.591 | 4.849 | 3.214 |
| 4.27884919418917 | 5.667 | 4.777 | 3.23 |
| 4.28199078684276 | 5.744 | 4.707 | 3.247 |
| 4.285132379496351 | 5.824 | 4.639 | 3.265 |
| 4.28827397214994 | 5.905 | 4.573 | 3.284 |
| 4.29141556480353 | 5.988 | 4.509 | 3.303 |
| 4.294557157457119 | 6.073 | 4.446 | 3.324 |
| 4.29769875011071 | 6.16 | 4.385 | 3.344 |
| 4.300840342764299 | 6.249 | 4.326 | 3.366 |
| 4.303981935417888 | 6.34 | 4.268 | 3.389 |
| 4.307123528071478 | 6.433 | 4.212 | 3.412 |
| 4.310265120725067 | 6.529 | 4.157 | 3.437 |
| 4.313406713378657 | 6.626 | 4.103 | 3.462 |
| 4.316548306032247 | 6.726 | 4.051 | 3.488 |
| 4.319689898685836 | 6.828 | 4 | 3.515 |
| 4.322831491339426 | 6.933 | 3.95 | 3.543 |
| 4.325973083993015 | 7.041 | 3.902 | 3.572 |
| 4.329114676646605 | 7.151 | 3.855 | 3.601 |
| 4.332256269300195 | 7.264 | 3.809 | 3.632 |
| 4.335397861953784 | 7.379 | 3.764 | 3.664 |
| 4.338539454607374 | 7.498 | 3.72 | 3.697 |
| 4.341681047260963 | 7.619 | 3.677 | 3.732 |
| 4.344822639914553 | 7.744 | 3.635 | 3.767 |
| 4.347964232568143 | 7.872 | 3.594 | 3.803 |
| 4.351105825221732 | 8.004 | 3.555 | 3.841 |
| 4.354247417875322 | 8.138 | 3.516 | 3.88 |
| 4.357389010528911 | 8.277 | 3.478 | 3.92 |
| 4.360530603182501 | 8.419 | 3.44 | 3.962 |
| 4.36367219583609 | 8.565 | 3.404 | 4.005 |
| 4.36681378848968 | 8.715 | 3.369 | 4.049 |
| 4.36995538114327 | 8.869 | 3.334 | 4.095 |
| 4.373096973796859 | 9.028 | 3.3 | 4.143 |
| 4.376238566450449 | 9.191 | 3.267 | 4.192 |
| 4.379380159104038 | 9.358 | 3.235 | 4.242 |
| 4.382521751757628 | 9.531 | 3.203 | 4.294 |
| 4.385663344411217 | 9.708 | 3.172 | 4.349 |
| 4.388804937064807 | 9.891 | 3.142 | 4.404 |
| 4.391946529718397 | 10.079 | 3.113 | 4.462 |
| 4.395088122371987 | 10.273 | 3.084 | 4.522 |
| 4.398229715025576 | 10.472 | 3.056 | 4.584 |
| 4.401371307679165 | 10.678 | 3.028 | 4.647 |
| 4.404512900332755 | 10.89 | 3.001 | 4.713 |
| 4.407654492986345 | 11.108 | 2.975 | 4.782 |
| 4.410796085639934 | 11.334 | 2.949 | 4.852 |
| 4.413937678293524 | 11.566 | 2.924 | 4.926 |
| 4.417079270947114 | 11.806 | 2.899 | 5.001 |
| 4.420220863600703 | 12.054 | 2.875 | 5.08 |
| 4.423362456254293 | 12.31 | 2.851 | 5.161 |
| 4.426504048907883 | 12.574 | 2.828 | 5.245 |
| 4.429645641561472 | 12.848 | 2.805 | 5.332 |
| 4.432787234215062 | 13.13 | 2.783 | 5.422 |
| 4.435928826868651 | 13.422 | 2.762 | 5.515 |
| 4.43907041952224 | 13.725 | 2.741 | 5.612 |
| 4.44221201217583 | 14.038 | 2.72 | 5.713 |
| 4.44535360482942 | 14.362 | 2.7 | 5.817 |
| 4.44849519748301 | 14.698 | 2.68 | 5.926 |
| 4.4516367901366 | 15.046 | 2.66 | 6.038 |
| 4.454778382790188 | 15.406 | 2.641 | 6.155 |
| 4.457919975443779 | 15.781 | 2.623 | 6.276 |
| 4.461061568097368 | 16.169 | 2.604 | 6.402 |
| 4.464203160750958 | 16.572 | 2.587 | 6.533 |
| 4.467344753404547 | 16.991 | 2.569 | 6.669 |
| 4.470486346058137 | 17.426 | 2.552 | 6.811 |
| 4.473627938711726 | 17.879 | 2.536 | 6.959 |
| 4.476769531365316 | 18.35 | 2.519 | 7.113 |
| 4.479911124018905 | 18.84 | 2.503 | 7.273 |
| 4.483052716672495 | 19.35 | 2.488 | 7.44 |
| 4.486194309326085 | 19.882 | 2.472 | 7.614 |
| 4.489335901979674 | 20.436 | 2.457 | 7.796 |
| 4.492477494633264 | 21.014 | 2.443 | 7.986 |
| 4.495619087286854 | 21.618 | 2.429 | 8.184 |
| 4.498760679940443 | 22.248 | 2.415 | 8.392 |
| 4.501902272594033 | 22.907 | 2.401 | 8.609 |
| 4.505043865247622 | 23.596 | 2.388 | 8.836 |
| 4.508185457901212 | 24.317 | 2.375 | 9.074 |
| 4.511327050554801 | 25.073 | 2.362 | 9.323 |
| 4.514468643208391 | 25.864 | 2.349 | 9.584 |
| 4.517610235861981 | 26.694 | 2.337 | 9.858 |
| 4.520751828515571 | 27.565 | 2.325 | 10.146 |
| 4.52389342116916 | 28.48 | 2.314 | 10.449 |
| 4.52703501382275 | 29.443 | 2.302 | 10.767 |
| 4.530176606476339 | 30.455 | 2.291 | 11.102 |
| 4.533318199129928 | 31.521 | 2.28 | 11.456 |
| 4.536459791783518 | 32.644 | 2.27 | 11.828 |
| 4.539601384437108 | 33.83 | 2.259 | 12.221 |
| 4.542742977090698 | 35.082 | 2.249 | 12.636 |
| 4.545884569744287 | 36.405 | 2.239 | 13.075 |
| 4.549026162397876 | 37.806 | 2.23 | 13.54 |
| 4.552167755051466 | 39.29 | 2.22 | 14.033 |
| 4.555309347705056 | 40.863 | 2.211 | 14.556 |
| 4.558450940358646 | 42.534 | 2.202 | 15.111 |
| 4.561592533012235 | 44.311 | 2.194 | 15.701 |
| 4.564734125665825 | 46.202 | 2.185 | 16.33 |
| 4.567875718319415 | 48.218 | 2.177 | 17 |
| 4.571017310973004 | 50.37 | 2.169 | 17.715 |
| 4.574158903626594 | 52.67 | 2.161 | 18.48 |
| 4.577300496280183 | 55.132 | 2.153 | 19.3 |
| 4.580442088933772 | 57.773 | 2.146 | 20.178 |
| 4.583583681587362 | 60.609 | 2.139 | 21.122 |
| 4.586725274240952 | 63.66 | 2.132 | 22.138 |
| 4.589866866894542 | 66.949 | 2.125 | 23.233 |
| 4.593008459548131 | 70.501 | 2.118 | 24.415 |
| 4.596150052201721 | 74.345 | 2.112 | 25.695 |
| 4.59929164485531 | 78.514 | 2.106 | 27.083 |
| 4.6024332375089 | 83.045 | 2.1 | 28.593 |
| 4.60557483016249 | 87.982 | 2.094 | 30.237 |
| 4.608716422816079 | 93.375 | 2.089 | 32.033 |
| 4.611858015469668 | 99.28 | 2.083 | 34.001 |
| 4.614999608123258 | 105.767 | 2.078 | 36.162 |
| 4.618141200776848 | 112.913 | 2.073 | 38.543 |
| 4.621282793430437 | 120.811 | 2.068 | 41.174 |
| 4.624424386084027 | 129.57 | 2.063 | 44.093 |
| 4.627565978737617 | 139.32 | 2.059 | 47.342 |
| 4.630707571391206 | 150.217 | 2.054 | 50.973 |
| 4.633849164044795 | 162.448 | 2.05 | 55.049 |
| 4.636990756698386 | 176.239 | 2.046 | 59.645 |
| 4.640132349351975 | 191.867 | 2.042 | 64.854 |
| 4.643273942005564 | 209.675 | 2.039 | 70.789 |
| 4.646415534659154 | 230.087 | 2.035 | 77.592 |
| 4.649557127312744 | 253.637 | 2.032 | 85.441 |
| 4.652698719966334 | 281.002 | 2.029 | 94.562 |
| 4.655840312619923 | 313.053 | 2.026 | 105.246 |
| 4.658981905273513 | 350.926 | 2.023 | 117.869 |
| 4.662123497927102 | 396.119 | 2.02 | 132.933 |
| 4.665265090580692 | 450.65 | 2.018 | 151.109 |
| 4.668406683234282 | 517.278 | 2.016 | 173.318 |
| 4.671548275887871 | 599.867 | 2.013 | 200.848 |
| 4.674689868541461 | 703.953 | 2.011 | 235.542 |
| 4.67783146119505 | 837.699 | 2.01 | 280.124 |
| 4.68097305384864 | 1013.545 | 2.008 | 338.739 |
| 4.68411464650223 | 1251.212 | 2.006 | 417.961 |
| 4.687256239155819 | 1583.477 | 2.005 | 528.716 |
| 4.690397831809409 | 2068.113 | 2.004 | 690.261 |
| 4.693539424462998 | 2814.811 | 2.003 | 939.16 |
| 4.696681017116588 | 4053.181 | 2.002 | 1351.95 |
| 4.699822609770177 | 6332.907 | 2.001 | 2111.858 |
| 4.702964202423767 | 11258.243 | 2.001 | 3753.637 |
| 4.706105795077356 | 25330.629 | 2 | 8444.432 |
| 4.709247387730946 | 101321.517 | 2 | 33774.728 |
| 4.712388980384535 | 42254127899613098051371008 | 2 | 14139077694956498979913728 |
| 4.715530573038126 | 101321.517 | 2 | 33774.728 |
| 4.718672165691715 | 25330.629 | 2 | 8444.432 |
| 4.721813758345305 | 11258.243 | 2.001 | 3753.637 |
| 4.724955350998894 | 6332.907 | 2.001 | 2111.858 |
| 4.728096943652484 | 4053.181 | 2.002 | 1351.95 |
| 4.731238536306074 | 2814.811 | 2.003 | 939.16 |
| 4.734380128959663 | 2068.113 | 2.004 | 690.261 |
| 4.737521721613253 | 1583.477 | 2.005 | 528.716 |
| 4.740663314266842 | 1251.212 | 2.006 | 417.961 |
| 4.743804906920432 | 1013.545 | 2.008 | 338.739 |
| 4.74694649957402 | 837.699 | 2.01 | 280.124 |
| 4.750088092227611 | 703.953 | 2.011 | 235.542 |
| 4.7532296848812 | 599.867 | 2.013 | 200.848 |
| 4.75637127753479 | 517.278 | 2.016 | 173.318 |
| 4.75951287018838 | 450.65 | 2.018 | 151.109 |
| 4.76265446284197 | 396.119 | 2.02 | 132.933 |
| 4.765796055495559 | 350.926 | 2.023 | 117.869 |
| 4.768937648149149 | 313.053 | 2.026 | 105.246 |
| 4.772079240802738 | 281.002 | 2.029 | 94.562 |
| 4.775220833456327 | 253.637 | 2.032 | 85.441 |
| 4.778362426109917 | 230.087 | 2.035 | 77.592 |
| 4.781504018763507 | 209.675 | 2.039 | 70.789 |
| 4.784645611417097 | 191.867 | 2.042 | 64.854 |
| 4.787787204070686 | 176.239 | 2.046 | 59.645 |
| 4.790928796724275 | 162.448 | 2.05 | 55.049 |
| 4.794070389377865 | 150.217 | 2.054 | 50.973 |
| 4.797211982031455 | 139.32 | 2.059 | 47.342 |
| 4.800353574685045 | 129.57 | 2.063 | 44.093 |
| 4.803495167338634 | 120.811 | 2.068 | 41.174 |
| 4.806636759992224 | 112.913 | 2.073 | 38.543 |
| 4.809778352645814 | 105.767 | 2.078 | 36.162 |
| 4.812919945299403 | 99.28 | 2.083 | 34.001 |
| 4.816061537952993 | 93.375 | 2.089 | 32.033 |
| 4.819203130606582 | 87.982 | 2.094 | 30.237 |
| 4.822344723260172 | 83.045 | 2.1 | 28.593 |
| 4.825486315913761 | 78.514 | 2.106 | 27.083 |
| 4.828627908567351 | 74.345 | 2.112 | 25.695 |
| 4.83176950122094 | 70.501 | 2.118 | 24.415 |
| 4.83491109387453 | 66.949 | 2.125 | 23.233 |
| 4.83805268652812 | 63.66 | 2.132 | 22.138 |
| 4.841194279181709 | 60.609 | 2.139 | 21.122 |
| 4.844335871835299 | 57.773 | 2.146 | 20.178 |
| 4.847477464488889 | 55.132 | 2.153 | 19.3 |
| 4.850619057142478 | 52.67 | 2.161 | 18.48 |
| 4.853760649796068 | 50.37 | 2.169 | 17.715 |
| 4.856902242449657 | 48.218 | 2.177 | 17 |
| 4.860043835103247 | 46.202 | 2.185 | 16.33 |
| 4.863185427756837 | 44.311 | 2.194 | 15.701 |
| 4.866327020410426 | 42.534 | 2.202 | 15.111 |
| 4.869468613064015 | 40.863 | 2.211 | 14.556 |
| 4.872610205717605 | 39.29 | 2.22 | 14.033 |
| 4.875751798371195 | 37.806 | 2.23 | 13.54 |
| 4.878893391024784 | 36.405 | 2.239 | 13.075 |
| 4.882034983678374 | 35.082 | 2.249 | 12.636 |
| 4.885176576331964 | 33.83 | 2.259 | 12.221 |
| 4.888318168985553 | 32.644 | 2.27 | 11.828 |
| 4.891459761639143 | 31.521 | 2.28 | 11.456 |
| 4.894601354292733 | 30.455 | 2.291 | 11.102 |
| 4.897742946946322 | 29.443 | 2.302 | 10.767 |
| 4.900884539599912 | 28.48 | 2.314 | 10.449 |
| 4.904026132253501 | 27.565 | 2.325 | 10.146 |
| 4.907167724907091 | 26.694 | 2.337 | 9.858 |
| 4.91030931756068 | 25.864 | 2.349 | 9.584 |
| 4.91345091021427 | 25.073 | 2.362 | 9.323 |
| 4.91659250286786 | 24.317 | 2.375 | 9.074 |
| 4.91973409552145 | 23.596 | 2.388 | 8.836 |
| 4.922875688175039 | 22.907 | 2.401 | 8.609 |
| 4.926017280828628 | 22.248 | 2.415 | 8.392 |
| 4.929158873482218 | 21.618 | 2.429 | 8.184 |
| 4.932300466135808 | 21.014 | 2.443 | 7.986 |
| 4.935442058789397 | 20.436 | 2.457 | 7.796 |
| 4.938583651442987 | 19.882 | 2.472 | 7.614 |
| 4.941725244096576 | 19.35 | 2.488 | 7.44 |
| 4.944866836750166 | 18.84 | 2.503 | 7.273 |
| 4.948008429403755 | 18.35 | 2.519 | 7.113 |
| 4.951150022057345 | 17.879 | 2.536 | 6.959 |
| 4.954291614710935 | 17.426 | 2.552 | 6.811 |
| 4.957433207364524 | 16.991 | 2.569 | 6.669 |
| 4.960574800018114 | 16.572 | 2.587 | 6.533 |
| 4.963716392671704 | 16.169 | 2.604 | 6.402 |
| 4.966857985325293 | 15.781 | 2.623 | 6.276 |
| 4.969999577978883 | 15.406 | 2.641 | 6.155 |
| 4.973141170632472 | 15.046 | 2.66 | 6.038 |
| 4.976282763286062 | 14.698 | 2.68 | 5.926 |
| 4.979424355939651 | 14.362 | 2.7 | 5.817 |
| 4.982565948593241 | 14.038 | 2.72 | 5.713 |
| 4.985707541246831 | 13.725 | 2.741 | 5.612 |
| 4.98884913390042 | 13.422 | 2.762 | 5.515 |
| 4.99199072655401 | 13.13 | 2.783 | 5.422 |
| 4.9951323192076 | 12.848 | 2.805 | 5.332 |
| 4.99827391186119 | 12.574 | 2.828 | 5.245 |
| 5.00141550451478 | 12.31 | 2.851 | 5.161 |
| 5.004557097168369 | 12.054 | 2.875 | 5.08 |
| 5.007698689821958 | 11.806 | 2.899 | 5.001 |
| 5.010840282475548 | 11.566 | 2.924 | 4.926 |
| 5.013981875129137 | 11.334 | 2.949 | 4.852 |
| 5.017123467782727 | 11.108 | 2.975 | 4.782 |
| 5.020265060436317 | 10.89 | 3.001 | 4.713 |
| 5.023406653089906 | 10.678 | 3.028 | 4.647 |
| 5.026548245743496 | 10.472 | 3.056 | 4.584 |
| 5.029689838397085 | 10.273 | 3.084 | 4.522 |
| 5.032831431050674 | 10.079 | 3.113 | 4.462 |
| 5.035973023704264 | 9.891 | 3.142 | 4.404 |
| 5.039114616357854 | 9.708 | 3.172 | 4.349 |
| 5.042256209011444 | 9.531 | 3.203 | 4.294 |
| 5.045397801665033 | 9.358 | 3.235 | 4.242 |
| 5.048539394318622 | 9.191 | 3.267 | 4.192 |
| 5.051680986972213 | 9.028 | 3.3 | 4.143 |
| 5.054822579625802 | 8.869 | 3.334 | 4.095 |
| 5.057964172279392 | 8.715 | 3.369 | 4.049 |
| 5.061105764932981 | 8.565 | 3.404 | 4.005 |
| 5.064247357586571 | 8.419 | 3.44 | 3.962 |
| 5.067388950240161 | 8.277 | 3.478 | 3.92 |
| 5.07053054289375 | 8.138 | 3.516 | 3.88 |
| 5.07367213554734 | 8.004 | 3.555 | 3.841 |
| 5.07681372820093 | 7.872 | 3.594 | 3.803 |
| 5.079955320854519 | 7.744 | 3.635 | 3.767 |
| 5.083096913508108 | 7.619 | 3.677 | 3.732 |
| 5.086238506161698 | 7.498 | 3.72 | 3.697 |
| 5.089380098815288 | 7.379 | 3.764 | 3.664 |
| 5.092521691468877 | 7.264 | 3.809 | 3.632 |
| 5.095663284122466 | 7.151 | 3.855 | 3.601 |
| 5.098804876776057 | 7.041 | 3.902 | 3.572 |
| 5.101946469429646 | 6.933 | 3.95 | 3.543 |
| 5.105088062083236 | 6.828 | 4 | 3.515 |
| 5.108229654736825 | 6.726 | 4.051 | 3.488 |
| 5.111371247390415 | 6.626 | 4.103 | 3.462 |
| 5.114512840044005 | 6.529 | 4.157 | 3.437 |
| 5.117654432697594 | 6.433 | 4.212 | 3.412 |
| 5.120796025351184 | 6.34 | 4.268 | 3.389 |
| 5.123937618004773 | 6.249 | 4.326 | 3.366 |
| 5.127079210658363 | 6.16 | 4.385 | 3.344 |
| 5.130220803311953 | 6.073 | 4.446 | 3.324 |
| 5.133362395965542 | 5.988 | 4.509 | 3.303 |
| 5.136503988619131 | 5.905 | 4.573 | 3.284 |
| 5.13964558127272 | 5.824 | 4.639 | 3.265 |
| 5.142787173926311 | 5.744 | 4.707 | 3.247 |
| 5.1459287665799 | 5.667 | 4.777 | 3.23 |
| 5.14907035923349 | 5.591 | 4.849 | 3.214 |
| 5.15221195188708 | 5.516 | 4.922 | 3.198 |
| 5.15535354454067 | 5.443 | 4.998 | 3.183 |
| 5.158495137194259 | 5.372 | 5.076 | 3.168 |
| 5.161636729847848 | 5.302 | 5.156 | 3.154 |
| 5.164778322501438 | 5.234 | 5.239 | 3.141 |
| 5.167919915155028 | 5.167 | 5.324 | 3.129 |
| 5.171061507808617 | 5.101 | 5.412 | 3.117 |
| 5.174203100462206 | 5.037 | 5.502 | 3.105 |
| 5.177344693115796 | 4.974 | 5.595 | 3.095 |
| 5.180486285769386 | 4.912 | 5.69 | 3.085 |
| 5.183627878422976 | 4.852 | 5.789 | 3.075 |
| 5.186769471076565 | 4.793 | 5.891 | 3.066 |
| 5.189911063730155 | 4.735 | 5.995 | 3.058 |
| 5.193052656383744 | 4.678 | 6.104 | 3.05 |
| 5.196194249037334 | 4.622 | 6.215 | 3.043 |
| 5.199335841690924 | 4.567 | 6.33 | 3.037 |
| 5.202477434344513 | 4.513 | 6.449 | 3.031 |
| 5.205619026998103 | 4.461 | 6.572 | 3.025 |
| 5.208760619651692 | 4.409 | 6.699 | 3.02 |
| 5.211902212305282 | 4.358 | 6.83 | 3.016 |
| 5.215043804958871 | 4.309 | 6.966 | 3.012 |
| 5.218185397612461 | 4.26 | 7.106 | 3.009 |
| 5.221326990266051 | 4.212 | 7.251 | 3.006 |
| 5.22446858291964 | 4.165 | 7.402 | 3.004 |
| 5.22761017557323 | 4.119 | 7.557 | 3.002 |
| 5.23075176822682 | 4.074 | 7.718 | 3.001 |
| 5.23389336088041 | 4.029 | 7.885 | 3 |
| 5.237034953533999 | 3.986 | 8.058 | 3 |
| 5.240176546187588 | 3.943 | 8.238 | 3 |
| 5.243318138841178 | 3.901 | 8.424 | 3.001 |
| 5.246459731494767 | 3.859 | 8.617 | 3.003 |
| 5.249601324148357 | 3.819 | 8.818 | 3.005 |
| 5.252742916801947 | 3.779 | 9.027 | 3.008 |
| 5.255884509455536 | 3.739 | 9.244 | 3.011 |
| 5.259026102109125 | 3.701 | 9.469 | 3.014 |
| 5.262167694762715 | 3.663 | 9.704 | 3.019 |
| 5.265309287416305 | 3.626 | 9.948 | 3.023 |
| 5.268450880069895 | 3.589 | 10.202 | 3.029 |
| 5.271592472723484 | 3.553 | 10.467 | 3.034 |
| 5.274734065377074 | 3.518 | 10.744 | 3.041 |
| 5.277875658030664 | 3.483 | 11.032 | 3.048 |
| 5.281017250684253 | 3.449 | 11.333 | 3.055 |
| 5.284158843337843 | 3.415 | 11.648 | 3.064 |
| 5.287300435991432 | 3.382 | 11.976 | 3.072 |
| 5.290442028645022 | 3.35 | 12.32 | 3.082 |
| 5.293583621298612 | 3.318 | 12.68 | 3.091 |
| 5.296725213952201 | 3.286 | 13.057 | 3.102 |
| 5.299866806605791 | 3.255 | 13.452 | 3.113 |
| 5.30300839925938 | 3.225 | 13.867 | 3.125 |
| 5.30614999191297 | 3.195 | 14.301 | 3.137 |
| 5.30929158456656 | 3.165 | 14.758 | 3.15 |
| 5.312433177220149 | 3.136 | 15.239 | 3.163 |
| 5.315574769873739 | 3.108 | 15.744 | 3.178 |
| 5.318716362527328 | 3.079 | 16.277 | 3.193 |
| 5.321857955180918 | 3.052 | 16.838 | 3.208 |
| 5.324999547834508 | 3.025 | 17.43 | 3.225 |
| 5.328141140488097 | 2.998 | 18.056 | 3.242 |
| 5.331282733141686 | 2.971 | 18.717 | 3.259 |
| 5.334424325795276 | 2.945 | 19.417 | 3.278 |
| 5.337565918448866 | 2.92 | 20.158 | 3.297 |
| 5.340707511102456 | 2.894 | 20.944 | 3.317 |
| 5.343849103756045 | 2.87 | 21.779 | 3.337 |
| 5.346990696409634 | 2.845 | 22.667 | 3.359 |
| 5.350132289063224 | 2.821 | 23.612 | 3.381 |
| 5.353273881716814 | 2.797 | 24.62 | 3.404 |
| 5.356415474370403 | 2.774 | 25.695 | 3.428 |
| 5.359557067023993 | 2.751 | 26.845 | 3.453 |
| 5.362698659677583 | 2.728 | 28.075 | 3.479 |
| 5.365840252331172 | 2.706 | 29.395 | 3.506 |
| 5.368981844984762 | 2.684 | 30.813 | 3.533 |
| 5.372123437638351 | 2.662 | 32.338 | 3.562 |
| 5.375265030291941 | 2.641 | 33.982 | 3.591 |
| 5.378406622945531 | 2.62 | 35.758 | 3.622 |
| 5.38154821559912 | 2.599 | 37.679 | 3.654 |
| 5.38468980825271 | 2.578 | 39.764 | 3.686 |
| 5.387831400906299 | 2.558 | 42.029 | 3.72 |
| 5.39097299355989 | 2.538 | 44.497 | 3.755 |
| 5.394114586213479 | 2.518 | 47.193 | 3.791 |
| 5.397256178867068 | 2.499 | 50.145 | 3.828 |
| 5.400397771520657 | 2.48 | 53.388 | 3.867 |
| 5.403539364174247 | 2.461 | 56.961 | 3.907 |
| 5.406680956827837 | 2.443 | 60.91 | 3.948 |
| 5.409822549481426 | 2.424 | 65.289 | 3.99 |
| 5.412964142135016 | 2.406 | 70.164 | 4.034 |
| 5.416105734788605 | 2.388 | 75.612 | 4.08 |
| 5.419247327442195 | 2.371 | 81.727 | 4.127 |
| 5.422388920095785 | 2.354 | 88.622 | 4.175 |
| 5.425530512749375 | 2.336 | 96.436 | 4.225 |
| 5.428672105402964 | 2.32 | 105.34 | 4.277 |
| 5.431813698056554 | 2.303 | 115.546 | 4.33 |
| 5.434955290710143 | 2.287 | 127.32 | 4.386 |
| 5.438096883363733 | 2.27 | 141.003 | 4.443 |
| 5.441238476017322 | 2.254 | 157.028 | 4.502 |
| 5.444380068670912 | 2.239 | 175.964 | 4.563 |
| 5.447521661324502 | 2.223 | 198.561 | 4.626 |
| 5.450663253978091 | 2.208 | 225.826 | 4.691 |
| 5.453804846631681 | 2.193 | 259.14 | 4.759 |
| 5.456946439285271 | 2.178 | 300.434 | 4.829 |
| 5.46008803193886 | 2.163 | 352.477 | 4.901 |
| 5.46322962459245 | 2.148 | 419.35 | 4.976 |
| 5.466371217246039 | 2.134 | 507.273 | 5.053 |
| 5.46951280989963 | 2.12 | 626.106 | 5.133 |
| 5.472654402553218 | 2.106 | 792.239 | 5.216 |
| 5.475795995206808 | 2.092 | 1034.557 | 5.302 |
| 5.478937587860398 | 2.078 | 1407.906 | 5.392 |
| 5.482079180513987 | 2.065 | 2027.09 | 5.484 |
| 5.485220773167577 | 2.052 | 3166.954 | 5.58 |
| 5.488362365821166 | 2.038 | 5629.621 | 5.679 |
| 5.491503958474756 | 2.025 | 12665.815 | 5.782 |
| 5.494645551128346 | 2.013 | 50661.258 | 5.889 |
| 5.497787143781935 | 2 | 12166922683954200477433856 | 6 |
| 5.500928736435525 | 1.988 | 50661.258 | 6.115 |
| 5.504070329089115 | 1.975 | 12665.815 | 6.235 |
| 5.507211921742704 | 1.963 | 5629.621 | 6.359 |
| 5.510353514396294 | 1.951 | 3166.954 | 6.489 |
| 5.513495107049883 | 1.939 | 2027.09 | 6.623 |
| 5.516636699703473 | 1.927 | 1407.906 | 6.763 |
| 5.519778292357062 | 1.916 | 1034.557 | 6.909 |
| 5.522919885010652 | 1.904 | 792.239 | 7.061 |
| 5.526061477664242 | 1.893 | 626.106 | 7.219 |
| 5.529203070317831 | 1.882 | 507.273 | 7.384 |
| 5.532344662971421 | 1.871 | 419.35 | 7.555 |
| 5.535486255625011 | 1.86 | 352.477 | 7.735 |
| 5.5386278482786 | 1.849 | 300.434 | 7.922 |
| 5.54176944093219 | 1.838 | 259.14 | 8.117 |
| 5.544911033585779 | 1.828 | 225.826 | 8.322 |
| 5.54805262623937 | 1.818 | 198.561 | 8.535 |
| 5.551194218892959 | 1.807 | 175.964 | 8.759 |
| 5.554335811546548 | 1.797 | 157.028 | 8.993 |
| 5.557477404200137 | 1.787 | 141.003 | 9.238 |
| 5.560618996853727 | 1.777 | 127.32 | 9.496 |
| 5.563760589507317 | 1.767 | 115.546 | 9.765 |
| 5.566902182160906 | 1.758 | 105.34 | 10.049 |
| 5.570043774814496 | 1.748 | 96.436 | 10.346 |
| 5.573185367468086 | 1.739 | 88.622 | 10.659 |
| 5.576326960121675 | 1.729 | 81.727 | 10.989 |
| 5.579468552775264 | 1.72 | 75.612 | 11.336 |
| 5.582610145428854 | 1.711 | 70.164 | 11.702 |
| 5.585751738082444 | 1.702 | 65.289 | 12.088 |
| 5.588893330736034 | 1.693 | 60.91 | 12.495 |
| 5.592034923389623 | 1.684 | 56.961 | 12.926 |
| 5.595176516043213 | 1.676 | 53.388 | 13.382 |
| 5.598318108696803 | 1.667 | 50.145 | 13.865 |
| 5.601459701350392 | 1.659 | 47.193 | 14.378 |
| 5.604601294003982 | 1.65 | 44.497 | 14.922 |
| 5.607742886657571 | 1.642 | 42.029 | 15.5 |
| 5.610884479311161 | 1.634 | 39.764 | 16.116 |
| 5.61402607196475 | 1.626 | 37.679 | 16.772 |
| 5.61716766461834 | 1.617 | 35.758 | 17.472 |
| 5.62030925727193 | 1.61 | 33.982 | 18.22 |
| 5.623450849925519 | 1.602 | 32.338 | 19.02 |
| 5.626592442579109 | 1.594 | 30.813 | 19.878 |
| 5.629734035232698 | 1.586 | 29.395 | 20.8 |
| 5.632875627886288 | 1.579 | 28.075 | 21.791 |
| 5.636017220539878 | 1.571 | 26.845 | 22.858 |
| 5.639158813193467 | 1.564 | 25.695 | 24.011 |
| 5.642300405847057 | 1.556 | 24.62 | 25.257 |
| 5.645441998500646 | 1.549 | 23.612 | 26.608 |
| 5.648583591154236 | 1.542 | 22.667 | 28.075 |
| 5.651725183807825 | 1.535 | 21.779 | 29.673 |
| 5.654866776461415 | 1.528 | 20.944 | 31.416 |
| 5.658008369115005 | 1.521 | 20.158 | 33.324 |
| 5.661149961768594 | 1.514 | 19.417 | 35.418 |
| 5.664291554422184 | 1.507 | 18.717 | 37.723 |
| 5.667433147075774 | 1.501 | 18.056 | 40.267 |
| 5.670574739729363 | 1.494 | 17.43 | 43.086 |
| 5.673716332382953 | 1.487 | 16.838 | 46.219 |
| 5.676857925036542 | 1.481 | 16.277 | 49.717 |
| 5.679999517690132 | 1.474 | 15.744 | 53.637 |
| 5.683141110343721 | 1.468 | 15.239 | 58.05 |
| 5.686282702997311 | 1.462 | 14.758 | 63.043 |
| 5.689424295650901 | 1.456 | 14.301 | 68.722 |
| 5.69256588830449 | 1.45 | 13.867 | 75.218 |
| 5.69570748095808 | 1.443 | 13.452 | 82.696 |
| 5.69884907361167 | 1.437 | 13.057 | 91.364 |
| 5.701990666265259 | 1.431 | 12.68 | 101.49 |
| 5.705132258918849 | 1.426 | 12.32 | 113.418 |
| 5.708273851572438 | 1.42 | 11.976 | 127.603 |
| 5.711415444226028 | 1.414 | 11.648 | 144.654 |
| 5.714557036879618 | 1.408 | 11.333 | 165.397 |
| 5.717698629533207 | 1.403 | 11.032 | 190.98 |
| 5.720840222186797 | 1.397 | 10.744 | 223.036 |
| 5.723981814840386 | 1.392 | 10.467 | 263.947 |
| 5.727123407493976 | 1.386 | 10.202 | 317.301 |
| 5.730265000147565 | 1.381 | 9.948 | 388.71 |
| 5.733406592801155 | 1.376 | 9.704 | 487.343 |
| 5.736548185454744 | 1.37 | 9.469 | 629.025 |
| 5.739689778108334 | 1.365 | 9.244 | 843.005 |
| 5.742831370761924 | 1.36 | 9.027 | 1188.358 |
| 5.745972963415514 | 1.355 | 8.818 | 1799.601 |
| 5.749114556069103 | 1.35 | 8.617 | 3040.636 |
| 5.752256148722693 | 1.345 | 8.424 | 6204.338 |
| 5.755397741376282 | 1.34 | 8.238 | 18998.722 |
| 5.758539334029872 | 1.335 | 8.058 | 303964.551 |
| 5.761680926683462 | 1.33 | 7.885 | 75991.888 |
| 5.764822519337051 | 1.325 | 7.718 | 12159.542 |
| 5.767964111990641 | 1.321 | 7.557 | 4750.431 |
| 5.77110570464423 | 1.316 | 7.402 | 2513.096 |
| 5.77424729729782 | 1.311 | 7.251 | 1551.835 |
| 5.77738888995141 | 1.307 | 7.106 | 1052.778 |
| 5.780530482605 | 1.302 | 6.966 | 760.91 |
| 5.783672075258588 | 1.298 | 6.83 | 575.601 |
| 5.786813667912178 | 1.293 | 6.699 | 450.652 |
| 5.789955260565768 | 1.289 | 6.572 | 362.433 |
| 5.793096853219358 | 1.285 | 6.449 | 297.841 |
| 5.796238445872947 | 1.28 | 6.33 | 249.136 |
| 5.799380038526537 | 1.276 | 6.215 | 211.504 |
| 5.802521631180126 | 1.272 | 6.104 | 181.826 |
| 5.805663223833715 | 1.268 | 5.995 | 158.01 |
| 5.808804816487306 | 1.264 | 5.891 | 138.607 |
| 5.811946409140895 | 1.26 | 5.789 | 122.59 |
| 5.815088001794485 | 1.256 | 5.69 | 109.216 |
| 5.818229594448074 | 1.252 | 5.595 | 97.933 |
| 5.821371187101663 | 1.248 | 5.502 | 88.328 |
| 5.824512779755254 | 1.244 | 5.412 | 80.082 |
| 5.827654372408843 | 1.24 | 5.324 | 72.952 |
| 5.830795965062433 | 1.236 | 5.239 | 66.745 |
| 5.833937557716022 | 1.232 | 5.156 | 61.308 |
| 5.837079150369612 | 1.229 | 5.076 | 56.519 |
| 5.840220743023201 | 1.225 | 4.998 | 52.279 |
| 5.843362335676791 | 1.221 | 4.922 | 48.507 |
| 5.846503928330381 | 1.218 | 4.849 | 45.137 |
| 5.84964552098397 | 1.214 | 4.777 | 42.113 |
| 5.85278711363756 | 1.211 | 4.707 | 39.39 |
| 5.85592870629115 | 1.207 | 4.639 | 36.929 |
| 5.85907029894474 | 1.204 | 4.573 | 34.698 |
| 5.862211891598329 | 1.2 | 4.509 | 32.669 |
| 5.865353484251918 | 1.197 | 4.446 | 30.818 |
| 5.868495076905508 | 1.194 | 4.385 | 29.125 |
| 5.871636669559098 | 1.191 | 4.326 | 27.572 |
| 5.874778262212687 | 1.187 | 4.268 | 26.145 |
| 5.877919854866277 | 1.184 | 4.212 | 24.831 |
| 5.881061447519866 | 1.181 | 4.157 | 23.617 |
| 5.884203040173456 | 1.178 | 4.103 | 22.493 |
| 5.887344632827046 | 1.175 | 4.051 | 21.452 |
| 5.890486225480635 | 1.172 | 4 | 20.485 |
| 5.893627818134224 | 1.169 | 3.95 | 19.586 |
| 5.896769410787814 | 1.166 | 3.902 | 18.747 |
| 5.899911003441404 | 1.163 | 3.855 | 17.965 |
| 5.903052596094994 | 1.16 | 3.809 | 17.233 |
| 5.906194188748583 | 1.157 | 3.764 | 16.548 |
| 5.909335781402172 | 1.154 | 3.72 | 15.906 |
| 5.912477374055762 | 1.151 | 3.677 | 15.303 |
| 5.915618966709352 | 1.148 | 3.635 | 14.737 |
| 5.918760559362942 | 1.146 | 3.594 | 14.204 |
| 5.921902152016531 | 1.143 | 3.555 | 13.701 |
| 5.92504374467012 | 1.14 | 3.516 | 13.227 |
| 5.92818533732371 | 1.137 | 3.478 | 12.78 |
| 5.9313269299773 | 1.135 | 3.44 | 12.357 |
| 5.93446852263089 | 1.132 | 3.404 | 11.957 |
| 5.93761011528448 | 1.13 | 3.369 | 11.578 |
| 5.940751707938068 | 1.127 | 3.334 | 11.218 |
| 5.943893300591658 | 1.125 | 3.3 | 10.877 |
| 5.947034893245248 | 1.122 | 3.267 | 10.553 |
| 5.950176485898837 | 1.12 | 3.235 | 10.245 |
| 5.953318078552427 | 1.117 | 3.203 | 9.953 |
| 5.956459671206017 | 1.115 | 3.172 | 9.674 |
| 5.959601263859606 | 1.112 | 3.142 | 9.408 |
| 5.962742856513196 | 1.11 | 3.113 | 9.155 |
| 5.965884449166785 | 1.108 | 3.084 | 8.914 |
| 5.969026041820375 | 1.106 | 3.056 | 8.683 |
| 5.972167634473964 | 1.103 | 3.028 | 8.463 |
| 5.975309227127554 | 1.101 | 3.001 | 8.253 |
| 5.978450819781144 | 1.099 | 2.975 | 8.051 |
| 5.981592412434733 | 1.097 | 2.949 | 7.859 |
| 5.984734005088323 | 1.095 | 2.924 | 7.674 |
| 5.987875597741913 | 1.093 | 2.899 | 7.497 |
| 5.991017190395502 | 1.09 | 2.875 | 7.328 |
| 5.994158783049092 | 1.088 | 2.851 | 7.165 |
| 5.997300375702681 | 1.086 | 2.828 | 7.009 |
| 6.000441968356271 | 1.084 | 2.805 | 6.86 |
| 6.003583561009861 | 1.082 | 2.783 | 6.716 |
| 6.00672515366345 | 1.081 | 2.762 | 6.578 |
| 6.00986674631704 | 1.079 | 2.741 | 6.445 |
| 6.01300833897063 | 1.077 | 2.72 | 6.317 |
| 6.01614993162422 | 1.075 | 2.7 | 6.195 |
| 6.019291524277808 | 1.073 | 2.68 | 6.076 |
| 6.022433116931398 | 1.071 | 2.66 | 5.963 |
| 6.025574709584988 | 1.069 | 2.641 | 5.853 |
| 6.028716302238577 | 1.068 | 2.623 | 5.747 |
| 6.031857894892167 | 1.066 | 2.604 | 5.646 |
| 6.034999487545757 | 1.064 | 2.587 | 5.547 |
| 6.038141080199346 | 1.063 | 2.569 | 5.453 |
| 6.041282672852935 | 1.061 | 2.552 | 5.361 |
| 6.044424265506525 | 1.059 | 2.536 | 5.273 |
| 6.047565858160115 | 1.058 | 2.519 | 5.188 |
| 6.050707450813704 | 1.056 | 2.503 | 5.106 |
| 6.053849043467294 | 1.054 | 2.488 | 5.027 |
| 6.056990636120884 | 1.053 | 2.472 | 4.95 |
| 6.060132228774473 | 1.051 | 2.457 | 4.877 |
| 6.063273821428063 | 1.05 | 2.443 | 4.805 |
| 6.066415414081653 | 1.049 | 2.429 | 4.736 |
| 6.069557006735242 | 1.047 | 2.415 | 4.669 |
| 6.072698599388831 | 1.046 | 2.401 | 4.605 |
| 6.07584019204242 | 1.044 | 2.388 | 4.542 |
| 6.078981784696011 | 1.043 | 2.375 | 4.482 |
| 6.082123377349601 | 1.042 | 2.362 | 4.423 |
| 6.08526497000319 | 1.04 | 2.349 | 4.367 |
| 6.08840656265678 | 1.039 | 2.337 | 4.312 |
| 6.09154815531037 | 1.038 | 2.325 | 4.259 |
| 6.094689747963959 | 1.036 | 2.314 | 4.208 |
| 6.097831340617549 | 1.035 | 2.302 | 4.159 |
| 6.100972933271138 | 1.034 | 2.291 | 4.111 |
| 6.104114525924728 | 1.033 | 2.28 | 4.064 |
| 6.107256118578317 | 1.032 | 2.27 | 4.019 |
| 6.110397711231907 | 1.03 | 2.259 | 3.976 |
| 6.113539303885497 | 1.029 | 2.249 | 3.934 |
| 6.116680896539086 | 1.028 | 2.239 | 3.893 |
| 6.119822489192675 | 1.027 | 2.23 | 3.854 |
| 6.122964081846265 | 1.026 | 2.22 | 3.816 |
| 6.126105674499855 | 1.025 | 2.211 | 3.779 |
| 6.129247267153445 | 1.024 | 2.202 | 3.743 |
| 6.132388859807034 | 1.023 | 2.194 | 3.709 |
| 6.135530452460624 | 1.022 | 2.185 | 3.675 |
| 6.138672045114213 | 1.021 | 2.177 | 3.643 |
| 6.141813637767803 | 1.02 | 2.169 | 3.612 |
| 6.144955230421393 | 1.019 | 2.161 | 3.581 |
| 6.148096823074982 | 1.018 | 2.153 | 3.552 |
| 6.151238415728571 | 1.018 | 2.146 | 3.524 |
| 6.154380008382161 | 1.017 | 2.139 | 3.497 |
| 6.157521601035751 | 1.016 | 2.132 | 3.47 |
| 6.16066319368934 | 1.015 | 2.125 | 3.445 |
| 6.16380478634293 | 1.014 | 2.118 | 3.42 |
| 6.16694637899652 | 1.014 | 2.112 | 3.397 |
| 6.170087971650109 | 1.013 | 2.106 | 3.374 |
| 6.173229564303698 | 1.012 | 2.1 | 3.352 |
| 6.176371156957289 | 1.011 | 2.094 | 3.33 |
| 6.179512749610878 | 1.011 | 2.089 | 3.31 |
| 6.182654342264468 | 1.01 | 2.083 | 3.29 |
| 6.185795934918057 | 1.01 | 2.078 | 3.271 |
| 6.188937527571647 | 1.009 | 2.073 | 3.253 |
| 6.192079120225237 | 1.008 | 2.068 | 3.236 |
| 6.195220712878826 | 1.008 | 2.063 | 3.219 |
| 6.198362305532415 | 1.007 | 2.059 | 3.203 |
| 6.201503898186005 | 1.007 | 2.054 | 3.188 |
| 6.204645490839594 | 1.006 | 2.05 | 3.173 |
| 6.207787083493184 | 1.006 | 2.046 | 3.159 |
| 6.210928676146774 | 1.005 | 2.042 | 3.146 |
| 6.214070268800364 | 1.005 | 2.039 | 3.133 |
| 6.217211861453953 | 1.004 | 2.035 | 3.121 |
| 6.220353454107543 | 1.004 | 2.032 | 3.109 |
| 6.223495046761133 | 1.004 | 2.029 | 3.098 |
| 6.226636639414722 | 1.003 | 2.026 | 3.088 |
| 6.229778232068312 | 1.003 | 2.023 | 3.078 |
| 6.232919824721901 | 1.003 | 2.02 | 3.069 |
| 6.236061417375491 | 1.002 | 2.018 | 3.061 |
| 6.23920301002908 | 1.002 | 2.016 | 3.053 |
| 6.24234460268267 | 1.002 | 2.013 | 3.045 |
| 6.24548619533626 | 1.001 | 2.011 | 3.039 |
| 6.24862778798985 | 1.001 | 2.01 | 3.032 |
| 6.251769380643438 | 1.001 | 2.008 | 3.027 |
| 6.254910973297028 | 1.001 | 2.006 | 3.022 |
| 6.258052565950618 | 1.001 | 2.005 | 3.017 |
| 6.261194158604208 | 1 | 2.004 | 3.013 |
| 6.264335751257797 | 1 | 2.003 | 3.01 |
| 6.267477343911387 | 1 | 2.002 | 3.007 |
| 6.270618936564976 | 1 | 2.001 | 3.004 |
| 6.273760529218566 | 1 | 2.001 | 3.002 |
| 6.276902121872155 | 1 | 2 | 3.001 |
| 6.280043714525745 | 1 | 2 | 3 |
| 6.283185307179335 | 1 | 2 | 3 |